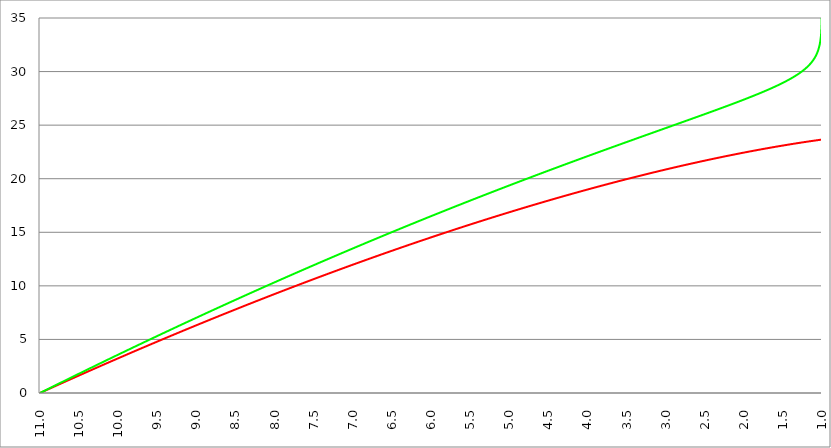
| Category | Series 1 | Series 0 | Series 2 |
|---|---|---|---|
| 11.0 | 0 | 0 |  |
| 10.995 | 0.017 | 0.018 |  |
| 10.99 | 0.033 | 0.036 |  |
| 10.985 | 0.05 | 0.055 |  |
| 10.98 | 0.066 | 0.073 |  |
| 10.975 | 0.083 | 0.091 |  |
| 10.97 | 0.099 | 0.109 |  |
| 10.96499999999999 | 0.116 | 0.128 |  |
| 10.96 | 0.133 | 0.146 |  |
| 10.955 | 0.149 | 0.164 |  |
| 10.95 | 0.166 | 0.182 |  |
| 10.945 | 0.182 | 0.2 |  |
| 10.94 | 0.199 | 0.219 |  |
| 10.93499999999999 | 0.215 | 0.237 |  |
| 10.92999999999999 | 0.232 | 0.255 |  |
| 10.92499999999999 | 0.248 | 0.273 |  |
| 10.91999999999999 | 0.265 | 0.291 |  |
| 10.91499999999999 | 0.281 | 0.31 |  |
| 10.90999999999999 | 0.298 | 0.328 |  |
| 10.90499999999999 | 0.314 | 0.346 |  |
| 10.89999999999998 | 0.331 | 0.364 |  |
| 10.89499999999998 | 0.347 | 0.382 |  |
| 10.88999999999998 | 0.364 | 0.401 |  |
| 10.88499999999998 | 0.38 | 0.419 |  |
| 10.87999999999998 | 0.397 | 0.437 |  |
| 10.87499999999998 | 0.413 | 0.455 |  |
| 10.86999999999998 | 0.43 | 0.473 |  |
| 10.86499999999998 | 0.446 | 0.491 |  |
| 10.85999999999998 | 0.463 | 0.509 |  |
| 10.85499999999998 | 0.479 | 0.528 |  |
| 10.84999999999998 | 0.496 | 0.546 |  |
| 10.84499999999998 | 0.512 | 0.564 |  |
| 10.83999999999997 | 0.529 | 0.582 |  |
| 10.83499999999997 | 0.545 | 0.6 |  |
| 10.82999999999997 | 0.562 | 0.618 |  |
| 10.82499999999997 | 0.578 | 0.636 |  |
| 10.81999999999997 | 0.595 | 0.655 |  |
| 10.81499999999997 | 0.611 | 0.673 |  |
| 10.80999999999997 | 0.627 | 0.691 |  |
| 10.80499999999997 | 0.644 | 0.709 |  |
| 10.79999999999997 | 0.66 | 0.727 |  |
| 10.79499999999997 | 0.677 | 0.745 |  |
| 10.78999999999997 | 0.693 | 0.763 |  |
| 10.78499999999997 | 0.71 | 0.781 |  |
| 10.77999999999997 | 0.726 | 0.799 |  |
| 10.77499999999996 | 0.742 | 0.817 |  |
| 10.76999999999996 | 0.759 | 0.836 |  |
| 10.76499999999996 | 0.775 | 0.854 |  |
| 10.75999999999996 | 0.792 | 0.872 |  |
| 10.75499999999996 | 0.808 | 0.89 |  |
| 10.74999999999996 | 0.824 | 0.908 |  |
| 10.74499999999996 | 0.841 | 0.926 |  |
| 10.73999999999996 | 0.857 | 0.944 |  |
| 10.73499999999996 | 0.874 | 0.962 |  |
| 10.72999999999996 | 0.89 | 0.98 |  |
| 10.72499999999996 | 0.906 | 0.998 |  |
| 10.71999999999996 | 0.923 | 1.016 |  |
| 10.71499999999996 | 0.939 | 1.034 |  |
| 10.70999999999995 | 0.955 | 1.052 |  |
| 10.70499999999995 | 0.972 | 1.07 |  |
| 10.69999999999995 | 0.988 | 1.088 |  |
| 10.69499999999995 | 1.005 | 1.107 |  |
| 10.68999999999995 | 1.021 | 1.125 |  |
| 10.68499999999995 | 1.037 | 1.143 |  |
| 10.67999999999995 | 1.054 | 1.161 |  |
| 10.67499999999995 | 1.07 | 1.179 |  |
| 10.66999999999995 | 1.086 | 1.197 |  |
| 10.66499999999995 | 1.103 | 1.215 |  |
| 10.65999999999995 | 1.119 | 1.233 |  |
| 10.65499999999995 | 1.135 | 1.251 |  |
| 10.64999999999995 | 1.152 | 1.269 |  |
| 10.64499999999994 | 1.168 | 1.287 |  |
| 10.63999999999994 | 1.184 | 1.305 |  |
| 10.63499999999994 | 1.2 | 1.323 |  |
| 10.62999999999994 | 1.217 | 1.341 |  |
| 10.62499999999994 | 1.233 | 1.359 |  |
| 10.61999999999994 | 1.249 | 1.377 |  |
| 10.61499999999994 | 1.266 | 1.395 |  |
| 10.60999999999994 | 1.282 | 1.413 |  |
| 10.60499999999994 | 1.298 | 1.431 |  |
| 10.59999999999994 | 1.315 | 1.449 |  |
| 10.59499999999994 | 1.331 | 1.467 |  |
| 10.58999999999994 | 1.347 | 1.485 |  |
| 10.58499999999994 | 1.363 | 1.503 |  |
| 10.57999999999993 | 1.38 | 1.521 |  |
| 10.57499999999993 | 1.396 | 1.538 |  |
| 10.56999999999993 | 1.412 | 1.556 |  |
| 10.56499999999993 | 1.428 | 1.574 |  |
| 10.55999999999993 | 1.445 | 1.592 |  |
| 10.55499999999993 | 1.461 | 1.61 |  |
| 10.54999999999993 | 1.477 | 1.628 |  |
| 10.54499999999993 | 1.493 | 1.646 |  |
| 10.53999999999993 | 1.51 | 1.664 |  |
| 10.53499999999993 | 1.526 | 1.682 |  |
| 10.52999999999993 | 1.542 | 1.7 |  |
| 10.52499999999993 | 1.558 | 1.718 |  |
| 10.51999999999992 | 1.574 | 1.736 |  |
| 10.51499999999992 | 1.591 | 1.754 |  |
| 10.50999999999992 | 1.607 | 1.772 |  |
| 10.50499999999992 | 1.623 | 1.79 |  |
| 10.49999999999992 | 1.639 | 1.807 |  |
| 10.49499999999992 | 1.656 | 1.825 |  |
| 10.48999999999992 | 1.672 | 1.843 |  |
| 10.48499999999992 | 1.688 | 1.861 |  |
| 10.47999999999992 | 1.704 | 1.879 |  |
| 10.47499999999992 | 1.72 | 1.897 |  |
| 10.46999999999992 | 1.736 | 1.915 |  |
| 10.46499999999992 | 1.753 | 1.933 |  |
| 10.45999999999992 | 1.769 | 1.951 |  |
| 10.45499999999991 | 1.785 | 1.969 |  |
| 10.44999999999991 | 1.801 | 1.986 |  |
| 10.44499999999991 | 1.817 | 2.004 |  |
| 10.43999999999991 | 1.833 | 2.022 |  |
| 10.43499999999991 | 1.85 | 2.04 |  |
| 10.42999999999991 | 1.866 | 2.058 |  |
| 10.42499999999991 | 1.882 | 2.076 |  |
| 10.41999999999991 | 1.898 | 2.094 |  |
| 10.41499999999991 | 1.914 | 2.111 |  |
| 10.40999999999991 | 1.93 | 2.129 |  |
| 10.40499999999991 | 1.946 | 2.147 |  |
| 10.39999999999991 | 1.963 | 2.165 |  |
| 10.39499999999991 | 1.979 | 2.183 |  |
| 10.3899999999999 | 1.995 | 2.201 |  |
| 10.3849999999999 | 2.011 | 2.218 |  |
| 10.3799999999999 | 2.027 | 2.236 |  |
| 10.3749999999999 | 2.043 | 2.254 |  |
| 10.3699999999999 | 2.059 | 2.272 |  |
| 10.3649999999999 | 2.075 | 2.29 |  |
| 10.3599999999999 | 2.091 | 2.308 |  |
| 10.3549999999999 | 2.108 | 2.325 |  |
| 10.3499999999999 | 2.124 | 2.343 |  |
| 10.3449999999999 | 2.14 | 2.361 |  |
| 10.3399999999999 | 2.156 | 2.379 |  |
| 10.3349999999999 | 2.172 | 2.397 |  |
| 10.3299999999999 | 2.188 | 2.414 |  |
| 10.32499999999989 | 2.204 | 2.432 |  |
| 10.31999999999989 | 2.22 | 2.45 |  |
| 10.31499999999989 | 2.236 | 2.468 |  |
| 10.3099999999999 | 2.252 | 2.486 |  |
| 10.3049999999999 | 2.268 | 2.503 |  |
| 10.2999999999999 | 2.284 | 2.521 |  |
| 10.29499999999989 | 2.3 | 2.539 |  |
| 10.28999999999989 | 2.316 | 2.557 |  |
| 10.28499999999989 | 2.332 | 2.574 |  |
| 10.27999999999989 | 2.348 | 2.592 |  |
| 10.27499999999989 | 2.364 | 2.61 |  |
| 10.26999999999989 | 2.381 | 2.628 |  |
| 10.26499999999989 | 2.397 | 2.645 |  |
| 10.25999999999988 | 2.413 | 2.663 |  |
| 10.25499999999988 | 2.429 | 2.681 |  |
| 10.24999999999988 | 2.445 | 2.699 |  |
| 10.24499999999988 | 2.461 | 2.716 |  |
| 10.23999999999988 | 2.477 | 2.734 |  |
| 10.23499999999988 | 2.493 | 2.752 |  |
| 10.22999999999988 | 2.509 | 2.77 |  |
| 10.22499999999988 | 2.525 | 2.787 |  |
| 10.21999999999988 | 2.541 | 2.805 |  |
| 10.21499999999988 | 2.557 | 2.823 |  |
| 10.20999999999988 | 2.573 | 2.84 |  |
| 10.20499999999988 | 2.588 | 2.858 |  |
| 10.19999999999987 | 2.604 | 2.876 |  |
| 10.19499999999987 | 2.62 | 2.894 |  |
| 10.18999999999987 | 2.636 | 2.911 |  |
| 10.18499999999987 | 2.652 | 2.929 |  |
| 10.17999999999987 | 2.668 | 2.947 |  |
| 10.17499999999987 | 2.684 | 2.964 |  |
| 10.16999999999987 | 2.7 | 2.982 |  |
| 10.16499999999987 | 2.716 | 3 |  |
| 10.15999999999987 | 2.732 | 3.017 |  |
| 10.15499999999987 | 2.748 | 3.035 |  |
| 10.14999999999987 | 2.764 | 3.053 |  |
| 10.14499999999987 | 2.78 | 3.07 |  |
| 10.13999999999987 | 2.796 | 3.088 |  |
| 10.13499999999986 | 2.812 | 3.106 |  |
| 10.12999999999986 | 2.828 | 3.123 |  |
| 10.12499999999986 | 2.844 | 3.141 |  |
| 10.11999999999986 | 2.859 | 3.159 |  |
| 10.11499999999986 | 2.875 | 3.176 |  |
| 10.10999999999986 | 2.891 | 3.194 |  |
| 10.10499999999986 | 2.907 | 3.212 |  |
| 10.09999999999986 | 2.923 | 3.229 |  |
| 10.09499999999986 | 2.939 | 3.247 |  |
| 10.08999999999986 | 2.955 | 3.265 |  |
| 10.08499999999986 | 2.971 | 3.282 |  |
| 10.07999999999986 | 2.987 | 3.3 |  |
| 10.07499999999986 | 3.002 | 3.317 |  |
| 10.06999999999985 | 3.018 | 3.335 |  |
| 10.06499999999985 | 3.034 | 3.353 |  |
| 10.05999999999985 | 3.05 | 3.37 |  |
| 10.05499999999985 | 3.066 | 3.388 |  |
| 10.04999999999985 | 3.082 | 3.405 |  |
| 10.04499999999985 | 3.098 | 3.423 |  |
| 10.03999999999985 | 3.113 | 3.441 |  |
| 10.03499999999985 | 3.129 | 3.458 |  |
| 10.02999999999985 | 3.145 | 3.476 |  |
| 10.02499999999985 | 3.161 | 3.493 |  |
| 10.01999999999985 | 3.177 | 3.511 |  |
| 10.01499999999985 | 3.193 | 3.529 |  |
| 10.00999999999985 | 3.208 | 3.546 |  |
| 10.00499999999984 | 3.224 | 3.564 |  |
| 9.999999999999844 | 3.24 | 3.581 |  |
| 9.994999999999841 | 3.256 | 3.599 |  |
| 9.98999999999984 | 3.272 | 3.616 |  |
| 9.98499999999984 | 3.287 | 3.634 |  |
| 9.97999999999984 | 3.303 | 3.652 |  |
| 9.97499999999984 | 3.319 | 3.669 |  |
| 9.969999999999837 | 3.335 | 3.687 |  |
| 9.964999999999838 | 3.351 | 3.704 |  |
| 9.959999999999837 | 3.366 | 3.722 |  |
| 9.954999999999837 | 3.382 | 3.739 |  |
| 9.949999999999836 | 3.398 | 3.757 |  |
| 9.944999999999835 | 3.414 | 3.774 |  |
| 9.939999999999834 | 3.43 | 3.792 |  |
| 9.934999999999834 | 3.445 | 3.809 |  |
| 9.929999999999833 | 3.461 | 3.827 |  |
| 9.92499999999983 | 3.477 | 3.844 |  |
| 9.91999999999983 | 3.493 | 3.862 |  |
| 9.91499999999983 | 3.508 | 3.879 |  |
| 9.90999999999983 | 3.524 | 3.897 |  |
| 9.904999999999829 | 3.54 | 3.914 |  |
| 9.899999999999826 | 3.555 | 3.932 |  |
| 9.894999999999827 | 3.571 | 3.949 |  |
| 9.889999999999826 | 3.587 | 3.967 |  |
| 9.884999999999826 | 3.603 | 3.984 |  |
| 9.879999999999823 | 3.618 | 4.002 |  |
| 9.874999999999824 | 3.634 | 4.019 |  |
| 9.869999999999823 | 3.65 | 4.037 |  |
| 9.864999999999823 | 3.666 | 4.054 |  |
| 9.85999999999982 | 3.681 | 4.072 |  |
| 9.85499999999982 | 3.697 | 4.089 |  |
| 9.84999999999982 | 3.713 | 4.107 |  |
| 9.84499999999982 | 3.728 | 4.124 |  |
| 9.839999999999819 | 3.744 | 4.142 |  |
| 9.834999999999818 | 3.76 | 4.159 |  |
| 9.829999999999817 | 3.775 | 4.177 |  |
| 9.824999999999816 | 3.791 | 4.194 |  |
| 9.819999999999816 | 3.807 | 4.212 |  |
| 9.814999999999815 | 3.822 | 4.229 |  |
| 9.809999999999812 | 3.838 | 4.246 |  |
| 9.804999999999813 | 3.854 | 4.264 |  |
| 9.799999999999812 | 3.869 | 4.281 |  |
| 9.794999999999812 | 3.885 | 4.299 |  |
| 9.78999999999981 | 3.901 | 4.316 |  |
| 9.78499999999981 | 3.916 | 4.334 |  |
| 9.77999999999981 | 3.932 | 4.351 |  |
| 9.774999999999809 | 3.948 | 4.368 |  |
| 9.769999999999808 | 3.963 | 4.386 |  |
| 9.764999999999807 | 3.979 | 4.403 |  |
| 9.759999999999806 | 3.994 | 4.421 |  |
| 9.754999999999805 | 4.01 | 4.438 |  |
| 9.749999999999805 | 4.026 | 4.455 |  |
| 9.744999999999804 | 4.041 | 4.473 |  |
| 9.739999999999803 | 4.057 | 4.49 |  |
| 9.734999999999802 | 4.072 | 4.508 |  |
| 9.729999999999801 | 4.088 | 4.525 |  |
| 9.7249999999998 | 4.104 | 4.542 |  |
| 9.7199999999998 | 4.119 | 4.56 |  |
| 9.7149999999998 | 4.135 | 4.577 |  |
| 9.709999999999798 | 4.15 | 4.594 |  |
| 9.704999999999798 | 4.166 | 4.612 |  |
| 9.699999999999797 | 4.182 | 4.629 |  |
| 9.694999999999794 | 4.197 | 4.647 |  |
| 9.689999999999795 | 4.213 | 4.664 |  |
| 9.684999999999794 | 4.228 | 4.681 |  |
| 9.679999999999794 | 4.244 | 4.699 |  |
| 9.674999999999793 | 4.259 | 4.716 |  |
| 9.66999999999979 | 4.275 | 4.733 |  |
| 9.66499999999979 | 4.291 | 4.751 |  |
| 9.65999999999979 | 4.306 | 4.768 |  |
| 9.65499999999979 | 4.322 | 4.785 |  |
| 9.649999999999787 | 4.337 | 4.803 |  |
| 9.644999999999788 | 4.353 | 4.82 |  |
| 9.639999999999787 | 4.368 | 4.837 |  |
| 9.634999999999787 | 4.384 | 4.855 |  |
| 9.629999999999786 | 4.399 | 4.872 |  |
| 9.624999999999785 | 4.415 | 4.889 |  |
| 9.619999999999784 | 4.43 | 4.907 |  |
| 9.614999999999783 | 4.446 | 4.924 |  |
| 9.609999999999783 | 4.461 | 4.941 |  |
| 9.60499999999978 | 4.477 | 4.958 |  |
| 9.59999999999978 | 4.492 | 4.976 |  |
| 9.59499999999978 | 4.508 | 4.993 |  |
| 9.58999999999978 | 4.523 | 5.01 |  |
| 9.584999999999779 | 4.539 | 5.028 |  |
| 9.579999999999778 | 4.554 | 5.045 |  |
| 9.574999999999777 | 4.57 | 5.062 |  |
| 9.569999999999776 | 4.585 | 5.079 |  |
| 9.564999999999776 | 4.601 | 5.097 |  |
| 9.559999999999773 | 4.616 | 5.114 |  |
| 9.554999999999774 | 4.632 | 5.131 |  |
| 9.549999999999773 | 4.647 | 5.149 |  |
| 9.544999999999773 | 4.662 | 5.166 |  |
| 9.539999999999772 | 4.678 | 5.183 |  |
| 9.534999999999771 | 4.693 | 5.2 |  |
| 9.52999999999977 | 4.709 | 5.218 |  |
| 9.52499999999977 | 4.724 | 5.235 |  |
| 9.519999999999769 | 4.74 | 5.252 |  |
| 9.514999999999768 | 4.755 | 5.269 |  |
| 9.509999999999767 | 4.77 | 5.286 |  |
| 9.504999999999766 | 4.786 | 5.304 |  |
| 9.499999999999766 | 4.801 | 5.321 |  |
| 9.494999999999765 | 4.817 | 5.338 |  |
| 9.489999999999762 | 4.832 | 5.355 |  |
| 9.484999999999763 | 4.847 | 5.373 |  |
| 9.47999999999976 | 4.863 | 5.39 |  |
| 9.47499999999976 | 4.878 | 5.407 |  |
| 9.46999999999976 | 4.894 | 5.424 |  |
| 9.46499999999976 | 4.909 | 5.441 |  |
| 9.45999999999976 | 4.924 | 5.459 |  |
| 9.454999999999758 | 4.94 | 5.476 |  |
| 9.449999999999758 | 4.955 | 5.493 |  |
| 9.444999999999757 | 4.971 | 5.51 |  |
| 9.439999999999756 | 4.986 | 5.527 |  |
| 9.434999999999755 | 5.001 | 5.545 |  |
| 9.429999999999755 | 5.017 | 5.562 |  |
| 9.424999999999754 | 5.032 | 5.579 |  |
| 9.419999999999751 | 5.047 | 5.596 |  |
| 9.414999999999752 | 5.063 | 5.613 |  |
| 9.40999999999975 | 5.078 | 5.63 |  |
| 9.40499999999975 | 5.093 | 5.648 |  |
| 9.39999999999975 | 5.109 | 5.665 |  |
| 9.39499999999975 | 5.124 | 5.682 |  |
| 9.389999999999748 | 5.139 | 5.699 |  |
| 9.384999999999748 | 5.155 | 5.716 |  |
| 9.379999999999747 | 5.17 | 5.733 |  |
| 9.374999999999744 | 5.185 | 5.75 |  |
| 9.369999999999745 | 5.201 | 5.768 |  |
| 9.364999999999744 | 5.216 | 5.785 |  |
| 9.35999999999974 | 5.231 | 5.802 |  |
| 9.35499999999974 | 5.246 | 5.819 |  |
| 9.34999999999974 | 5.262 | 5.836 |  |
| 9.34499999999974 | 5.277 | 5.853 |  |
| 9.33999999999974 | 5.292 | 5.87 |  |
| 9.33499999999974 | 5.308 | 5.887 |  |
| 9.329999999999737 | 5.323 | 5.905 |  |
| 9.324999999999738 | 5.338 | 5.922 |  |
| 9.319999999999737 | 5.353 | 5.939 |  |
| 9.314999999999737 | 5.369 | 5.956 |  |
| 9.309999999999736 | 5.384 | 5.973 |  |
| 9.304999999999733 | 5.399 | 5.99 |  |
| 9.299999999999734 | 5.414 | 6.007 |  |
| 9.294999999999733 | 5.43 | 6.024 |  |
| 9.289999999999733 | 5.445 | 6.041 |  |
| 9.28499999999973 | 5.46 | 6.058 |  |
| 9.27999999999973 | 5.475 | 6.075 |  |
| 9.27499999999973 | 5.491 | 6.093 |  |
| 9.26999999999973 | 5.506 | 6.11 |  |
| 9.264999999999729 | 5.521 | 6.127 |  |
| 9.259999999999726 | 5.536 | 6.144 |  |
| 9.254999999999727 | 5.552 | 6.161 |  |
| 9.249999999999726 | 5.567 | 6.178 |  |
| 9.244999999999726 | 5.582 | 6.195 |  |
| 9.239999999999725 | 5.597 | 6.212 |  |
| 9.234999999999724 | 5.612 | 6.229 |  |
| 9.229999999999723 | 5.628 | 6.246 |  |
| 9.224999999999723 | 5.643 | 6.263 |  |
| 9.219999999999722 | 5.658 | 6.28 |  |
| 9.214999999999721 | 5.673 | 6.297 |  |
| 9.20999999999972 | 5.688 | 6.314 |  |
| 9.20499999999972 | 5.703 | 6.331 |  |
| 9.199999999999719 | 5.719 | 6.348 |  |
| 9.194999999999718 | 5.734 | 6.365 |  |
| 9.189999999999717 | 5.749 | 6.382 |  |
| 9.184999999999716 | 5.764 | 6.399 |  |
| 9.179999999999715 | 5.779 | 6.416 |  |
| 9.174999999999715 | 5.794 | 6.433 |  |
| 9.169999999999712 | 5.81 | 6.45 |  |
| 9.164999999999713 | 5.825 | 6.467 |  |
| 9.15999999999971 | 5.84 | 6.484 |  |
| 9.15499999999971 | 5.855 | 6.501 |  |
| 9.14999999999971 | 5.87 | 6.518 |  |
| 9.14499999999971 | 5.885 | 6.535 |  |
| 9.13999999999971 | 5.9 | 6.552 |  |
| 9.134999999999708 | 5.915 | 6.569 |  |
| 9.129999999999708 | 5.931 | 6.586 |  |
| 9.124999999999707 | 5.946 | 6.603 |  |
| 9.119999999999706 | 5.961 | 6.62 |  |
| 9.114999999999705 | 5.976 | 6.637 |  |
| 9.109999999999705 | 5.991 | 6.654 |  |
| 9.104999999999704 | 6.006 | 6.671 |  |
| 9.099999999999701 | 6.021 | 6.688 |  |
| 9.094999999999702 | 6.036 | 6.705 |  |
| 9.0899999999997 | 6.051 | 6.722 |  |
| 9.0849999999997 | 6.066 | 6.739 |  |
| 9.0799999999997 | 6.081 | 6.755 |  |
| 9.0749999999997 | 6.096 | 6.772 |  |
| 9.069999999999698 | 6.112 | 6.789 |  |
| 9.064999999999698 | 6.127 | 6.806 |  |
| 9.059999999999697 | 6.142 | 6.823 |  |
| 9.054999999999694 | 6.157 | 6.84 |  |
| 9.049999999999695 | 6.172 | 6.857 |  |
| 9.044999999999694 | 6.187 | 6.874 |  |
| 9.039999999999694 | 6.202 | 6.891 |  |
| 9.034999999999693 | 6.217 | 6.908 |  |
| 9.02999999999969 | 6.232 | 6.925 |  |
| 9.02499999999969 | 6.247 | 6.942 |  |
| 9.01999999999969 | 6.262 | 6.958 |  |
| 9.01499999999969 | 6.277 | 6.975 |  |
| 9.009999999999687 | 6.292 | 6.992 |  |
| 9.004999999999688 | 6.307 | 7.009 |  |
| 8.999999999999687 | 6.322 | 7.026 |  |
| 8.994999999999687 | 6.337 | 7.043 |  |
| 8.989999999999686 | 6.352 | 7.06 |  |
| 8.984999999999683 | 6.367 | 7.077 |  |
| 8.979999999999684 | 6.382 | 7.093 |  |
| 8.974999999999683 | 6.397 | 7.11 |  |
| 8.96999999999968 | 6.412 | 7.127 |  |
| 8.96499999999968 | 6.427 | 7.144 |  |
| 8.95999999999968 | 6.442 | 7.161 |  |
| 8.95499999999968 | 6.457 | 7.178 |  |
| 8.94999999999968 | 6.472 | 7.195 |  |
| 8.944999999999679 | 6.487 | 7.211 |  |
| 8.939999999999676 | 6.502 | 7.228 |  |
| 8.934999999999677 | 6.517 | 7.245 |  |
| 8.929999999999676 | 6.532 | 7.262 |  |
| 8.924999999999676 | 6.546 | 7.279 |  |
| 8.919999999999675 | 6.561 | 7.295 |  |
| 8.914999999999674 | 6.576 | 7.312 |  |
| 8.909999999999673 | 6.591 | 7.329 |  |
| 8.904999999999673 | 6.606 | 7.346 |  |
| 8.89999999999967 | 6.621 | 7.363 |  |
| 8.89499999999967 | 6.636 | 7.38 |  |
| 8.88999999999967 | 6.651 | 7.396 |  |
| 8.88499999999967 | 6.666 | 7.413 |  |
| 8.879999999999669 | 6.681 | 7.43 |  |
| 8.874999999999668 | 6.696 | 7.447 |  |
| 8.869999999999665 | 6.711 | 7.464 |  |
| 8.864999999999666 | 6.725 | 7.48 |  |
| 8.859999999999665 | 6.74 | 7.497 |  |
| 8.854999999999665 | 6.755 | 7.514 |  |
| 8.849999999999662 | 6.77 | 7.531 |  |
| 8.844999999999663 | 6.785 | 7.547 |  |
| 8.83999999999966 | 6.8 | 7.564 |  |
| 8.83499999999966 | 6.815 | 7.581 |  |
| 8.82999999999966 | 6.829 | 7.598 |  |
| 8.82499999999966 | 6.844 | 7.614 |  |
| 8.81999999999966 | 6.859 | 7.631 |  |
| 8.814999999999658 | 6.874 | 7.648 |  |
| 8.809999999999658 | 6.889 | 7.665 |  |
| 8.804999999999657 | 6.904 | 7.681 |  |
| 8.799999999999656 | 6.919 | 7.698 |  |
| 8.794999999999655 | 6.933 | 7.715 |  |
| 8.789999999999655 | 6.948 | 7.732 |  |
| 8.784999999999654 | 6.963 | 7.748 |  |
| 8.779999999999651 | 6.978 | 7.765 |  |
| 8.774999999999652 | 6.993 | 7.782 |  |
| 8.76999999999965 | 7.007 | 7.798 |  |
| 8.76499999999965 | 7.022 | 7.815 |  |
| 8.75999999999965 | 7.037 | 7.832 |  |
| 8.754999999999647 | 7.052 | 7.849 |  |
| 8.749999999999648 | 7.067 | 7.865 |  |
| 8.744999999999647 | 7.081 | 7.882 |  |
| 8.739999999999647 | 7.096 | 7.899 |  |
| 8.734999999999644 | 7.111 | 7.915 |  |
| 8.729999999999645 | 7.126 | 7.932 |  |
| 8.724999999999644 | 7.141 | 7.949 |  |
| 8.719999999999644 | 7.155 | 7.965 |  |
| 8.714999999999643 | 7.17 | 7.982 |  |
| 8.70999999999964 | 7.185 | 7.999 |  |
| 8.70499999999964 | 7.2 | 8.015 |  |
| 8.69999999999964 | 7.214 | 8.032 |  |
| 8.69499999999964 | 7.229 | 8.049 |  |
| 8.689999999999637 | 7.244 | 8.065 |  |
| 8.684999999999638 | 7.259 | 8.082 |  |
| 8.679999999999637 | 7.273 | 8.099 |  |
| 8.674999999999637 | 7.288 | 8.115 |  |
| 8.669999999999636 | 7.303 | 8.132 |  |
| 8.664999999999633 | 7.318 | 8.149 |  |
| 8.659999999999634 | 7.332 | 8.165 |  |
| 8.654999999999633 | 7.347 | 8.182 |  |
| 8.649999999999633 | 7.362 | 8.199 |  |
| 8.644999999999632 | 7.376 | 8.215 |  |
| 8.63999999999963 | 7.391 | 8.232 |  |
| 8.63499999999963 | 7.406 | 8.248 |  |
| 8.62999999999963 | 7.42 | 8.265 |  |
| 8.624999999999629 | 7.435 | 8.282 |  |
| 8.619999999999626 | 7.45 | 8.298 |  |
| 8.614999999999627 | 7.464 | 8.315 |  |
| 8.609999999999626 | 7.479 | 8.331 |  |
| 8.604999999999626 | 7.494 | 8.348 |  |
| 8.599999999999625 | 7.508 | 8.365 |  |
| 8.594999999999624 | 7.523 | 8.381 |  |
| 8.589999999999623 | 7.538 | 8.398 |  |
| 8.584999999999622 | 7.552 | 8.414 |  |
| 8.57999999999962 | 7.567 | 8.431 |  |
| 8.57499999999962 | 7.582 | 8.448 |  |
| 8.56999999999962 | 7.596 | 8.464 |  |
| 8.56499999999962 | 7.611 | 8.481 |  |
| 8.559999999999619 | 7.626 | 8.497 |  |
| 8.554999999999618 | 7.64 | 8.514 |  |
| 8.549999999999617 | 7.655 | 8.53 |  |
| 8.544999999999616 | 7.67 | 8.547 |  |
| 8.539999999999615 | 7.684 | 8.564 |  |
| 8.534999999999615 | 7.699 | 8.58 |  |
| 8.529999999999612 | 7.713 | 8.597 |  |
| 8.524999999999613 | 7.728 | 8.613 |  |
| 8.51999999999961 | 7.743 | 8.63 |  |
| 8.51499999999961 | 7.757 | 8.646 |  |
| 8.50999999999961 | 7.772 | 8.663 |  |
| 8.50499999999961 | 7.786 | 8.679 |  |
| 8.49999999999961 | 7.801 | 8.696 |  |
| 8.494999999999608 | 7.815 | 8.712 |  |
| 8.489999999999608 | 7.83 | 8.729 |  |
| 8.484999999999607 | 7.845 | 8.745 |  |
| 8.479999999999606 | 7.859 | 8.762 |  |
| 8.474999999999605 | 7.874 | 8.778 |  |
| 8.469999999999605 | 7.888 | 8.795 |  |
| 8.464999999999604 | 7.903 | 8.811 |  |
| 8.4599999999996 | 7.917 | 8.828 |  |
| 8.4549999999996 | 7.932 | 8.844 |  |
| 8.4499999999996 | 7.946 | 8.861 |  |
| 8.4449999999996 | 7.961 | 8.877 |  |
| 8.4399999999996 | 7.976 | 8.894 |  |
| 8.4349999999996 | 7.99 | 8.91 |  |
| 8.429999999999598 | 8.005 | 8.927 |  |
| 8.424999999999597 | 8.019 | 8.943 |  |
| 8.419999999999597 | 8.034 | 8.96 |  |
| 8.414999999999594 | 8.048 | 8.976 |  |
| 8.409999999999595 | 8.063 | 8.993 |  |
| 8.404999999999594 | 8.077 | 9.009 |  |
| 8.399999999999594 | 8.092 | 9.025 |  |
| 8.394999999999593 | 8.106 | 9.042 |  |
| 8.38999999999959 | 8.121 | 9.058 |  |
| 8.38499999999959 | 8.135 | 9.075 |  |
| 8.37999999999959 | 8.15 | 9.091 |  |
| 8.37499999999959 | 8.164 | 9.108 |  |
| 8.369999999999589 | 8.178 | 9.124 |  |
| 8.364999999999588 | 8.193 | 9.141 |  |
| 8.359999999999587 | 8.207 | 9.157 |  |
| 8.354999999999587 | 8.222 | 9.173 |  |
| 8.349999999999586 | 8.236 | 9.19 |  |
| 8.344999999999585 | 8.251 | 9.206 |  |
| 8.339999999999584 | 8.265 | 9.223 |  |
| 8.334999999999583 | 8.28 | 9.239 |  |
| 8.329999999999583 | 8.294 | 9.255 |  |
| 8.324999999999582 | 8.308 | 9.272 |  |
| 8.31999999999958 | 8.323 | 9.288 |  |
| 8.31499999999958 | 8.337 | 9.305 |  |
| 8.30999999999958 | 8.352 | 9.321 |  |
| 8.304999999999579 | 8.366 | 9.337 |  |
| 8.299999999999578 | 8.381 | 9.354 |  |
| 8.294999999999577 | 8.395 | 9.37 |  |
| 8.289999999999576 | 8.409 | 9.387 |  |
| 8.284999999999576 | 8.424 | 9.403 |  |
| 8.279999999999575 | 8.438 | 9.419 |  |
| 8.274999999999574 | 8.453 | 9.436 |  |
| 8.269999999999573 | 8.467 | 9.452 |  |
| 8.264999999999572 | 8.481 | 9.468 |  |
| 8.259999999999572 | 8.496 | 9.485 |  |
| 8.254999999999571 | 8.51 | 9.501 |  |
| 8.24999999999957 | 8.524 | 9.517 |  |
| 8.24499999999957 | 8.539 | 9.534 |  |
| 8.239999999999569 | 8.553 | 9.55 |  |
| 8.234999999999568 | 8.567 | 9.566 |  |
| 8.229999999999567 | 8.582 | 9.583 |  |
| 8.224999999999566 | 8.596 | 9.599 |  |
| 8.219999999999565 | 8.61 | 9.615 |  |
| 8.214999999999565 | 8.625 | 9.632 |  |
| 8.209999999999564 | 8.639 | 9.648 |  |
| 8.204999999999563 | 8.653 | 9.664 |  |
| 8.199999999999562 | 8.668 | 9.681 |  |
| 8.194999999999562 | 8.682 | 9.697 |  |
| 8.18999999999956 | 8.696 | 9.713 |  |
| 8.18499999999956 | 8.711 | 9.73 |  |
| 8.17999999999956 | 8.725 | 9.746 |  |
| 8.174999999999558 | 8.739 | 9.762 |  |
| 8.169999999999558 | 8.754 | 9.778 |  |
| 8.164999999999557 | 8.768 | 9.795 |  |
| 8.159999999999556 | 8.782 | 9.811 |  |
| 8.154999999999555 | 8.796 | 9.827 |  |
| 8.149999999999554 | 8.811 | 9.844 |  |
| 8.144999999999554 | 8.825 | 9.86 |  |
| 8.139999999999553 | 8.839 | 9.876 |  |
| 8.134999999999552 | 8.854 | 9.892 |  |
| 8.129999999999551 | 8.868 | 9.909 |  |
| 8.12499999999955 | 8.882 | 9.925 |  |
| 8.11999999999955 | 8.896 | 9.941 |  |
| 8.11499999999955 | 8.911 | 9.957 |  |
| 8.109999999999548 | 8.925 | 9.974 |  |
| 8.104999999999547 | 8.939 | 9.99 |  |
| 8.099999999999547 | 8.953 | 10.006 |  |
| 8.094999999999544 | 8.967 | 10.022 |  |
| 8.089999999999545 | 8.982 | 10.038 |  |
| 8.084999999999544 | 8.996 | 10.055 |  |
| 8.079999999999544 | 9.01 | 10.071 |  |
| 8.074999999999543 | 9.024 | 10.087 |  |
| 8.06999999999954 | 9.039 | 10.103 |  |
| 8.06499999999954 | 9.053 | 10.12 |  |
| 8.05999999999954 | 9.067 | 10.136 |  |
| 8.05499999999954 | 9.081 | 10.152 |  |
| 8.049999999999539 | 9.095 | 10.168 |  |
| 8.044999999999538 | 9.11 | 10.184 |  |
| 8.039999999999537 | 9.124 | 10.201 |  |
| 8.034999999999537 | 9.138 | 10.217 |  |
| 8.029999999999536 | 9.152 | 10.233 |  |
| 8.024999999999535 | 9.166 | 10.249 |  |
| 8.019999999999534 | 9.18 | 10.265 |  |
| 8.014999999999533 | 9.195 | 10.281 |  |
| 8.009999999999533 | 9.209 | 10.298 |  |
| 8.004999999999532 | 9.223 | 10.314 |  |
| 7.999999999999531 | 9.237 | 10.33 |  |
| 7.994999999999532 | 9.251 | 10.346 |  |
| 7.989999999999532 | 9.265 | 10.362 |  |
| 7.984999999999532 | 9.279 | 10.378 |  |
| 7.979999999999532 | 9.294 | 10.395 |  |
| 7.974999999999532 | 9.308 | 10.411 |  |
| 7.969999999999532 | 9.322 | 10.427 |  |
| 7.964999999999533 | 9.336 | 10.443 |  |
| 7.959999999999532 | 9.35 | 10.459 |  |
| 7.954999999999533 | 9.364 | 10.475 |  |
| 7.949999999999532 | 9.378 | 10.491 |  |
| 7.944999999999533 | 9.392 | 10.508 |  |
| 7.939999999999533 | 9.406 | 10.524 |  |
| 7.934999999999533 | 9.42 | 10.54 |  |
| 7.929999999999533 | 9.435 | 10.556 |  |
| 7.924999999999534 | 9.449 | 10.572 |  |
| 7.919999999999533 | 9.463 | 10.588 |  |
| 7.914999999999534 | 9.477 | 10.604 |  |
| 7.909999999999533 | 9.491 | 10.62 |  |
| 7.904999999999534 | 9.505 | 10.636 |  |
| 7.899999999999534 | 9.519 | 10.653 |  |
| 7.894999999999534 | 9.533 | 10.669 |  |
| 7.889999999999534 | 9.547 | 10.685 |  |
| 7.884999999999534 | 9.561 | 10.701 |  |
| 7.879999999999534 | 9.575 | 10.717 |  |
| 7.874999999999534 | 9.589 | 10.733 |  |
| 7.869999999999534 | 9.603 | 10.749 |  |
| 7.864999999999535 | 9.617 | 10.765 |  |
| 7.859999999999534 | 9.631 | 10.781 |  |
| 7.854999999999535 | 9.645 | 10.797 |  |
| 7.849999999999535 | 9.659 | 10.813 |  |
| 7.844999999999535 | 9.673 | 10.829 |  |
| 7.839999999999535 | 9.687 | 10.845 |  |
| 7.834999999999535 | 9.701 | 10.861 |  |
| 7.829999999999535 | 9.715 | 10.877 |  |
| 7.824999999999536 | 9.729 | 10.893 |  |
| 7.819999999999535 | 9.743 | 10.91 |  |
| 7.814999999999536 | 9.757 | 10.926 |  |
| 7.809999999999535 | 9.771 | 10.942 |  |
| 7.804999999999536 | 9.785 | 10.958 |  |
| 7.799999999999536 | 9.799 | 10.974 |  |
| 7.794999999999536 | 9.813 | 10.99 |  |
| 7.789999999999536 | 9.827 | 11.006 |  |
| 7.784999999999536 | 9.841 | 11.022 |  |
| 7.779999999999536 | 9.855 | 11.038 |  |
| 7.774999999999536 | 9.869 | 11.054 |  |
| 7.769999999999536 | 9.883 | 11.07 |  |
| 7.764999999999537 | 9.897 | 11.086 |  |
| 7.759999999999536 | 9.911 | 11.102 |  |
| 7.754999999999537 | 9.925 | 11.118 |  |
| 7.749999999999537 | 9.939 | 11.134 |  |
| 7.744999999999537 | 9.952 | 11.15 |  |
| 7.739999999999537 | 9.966 | 11.166 |  |
| 7.734999999999537 | 9.98 | 11.182 |  |
| 7.729999999999537 | 9.994 | 11.198 |  |
| 7.724999999999538 | 10.008 | 11.213 |  |
| 7.719999999999537 | 10.022 | 11.229 |  |
| 7.714999999999538 | 10.036 | 11.245 |  |
| 7.709999999999538 | 10.05 | 11.261 |  |
| 7.704999999999538 | 10.064 | 11.277 |  |
| 7.699999999999538 | 10.077 | 11.293 |  |
| 7.694999999999538 | 10.091 | 11.309 |  |
| 7.689999999999538 | 10.105 | 11.325 |  |
| 7.684999999999539 | 10.119 | 11.341 |  |
| 7.679999999999538 | 10.133 | 11.357 |  |
| 7.674999999999539 | 10.147 | 11.373 |  |
| 7.669999999999539 | 10.161 | 11.389 |  |
| 7.664999999999539 | 10.175 | 11.405 |  |
| 7.65999999999954 | 10.188 | 11.421 |  |
| 7.654999999999539 | 10.202 | 11.437 |  |
| 7.64999999999954 | 10.216 | 11.453 |  |
| 7.644999999999539 | 10.23 | 11.468 |  |
| 7.63999999999954 | 10.244 | 11.484 |  |
| 7.63499999999954 | 10.257 | 11.5 |  |
| 7.62999999999954 | 10.271 | 11.516 |  |
| 7.62499999999954 | 10.285 | 11.532 |  |
| 7.61999999999954 | 10.299 | 11.548 |  |
| 7.61499999999954 | 10.313 | 11.564 |  |
| 7.60999999999954 | 10.327 | 11.58 |  |
| 7.60499999999954 | 10.34 | 11.596 |  |
| 7.59999999999954 | 10.354 | 11.611 |  |
| 7.594999999999541 | 10.368 | 11.627 |  |
| 7.58999999999954 | 10.382 | 11.643 |  |
| 7.584999999999541 | 10.395 | 11.659 |  |
| 7.57999999999954 | 10.409 | 11.675 |  |
| 7.574999999999541 | 10.423 | 11.691 |  |
| 7.569999999999541 | 10.437 | 11.707 |  |
| 7.564999999999541 | 10.45 | 11.722 |  |
| 7.559999999999541 | 10.464 | 11.738 |  |
| 7.554999999999541 | 10.478 | 11.754 |  |
| 7.549999999999541 | 10.492 | 11.77 |  |
| 7.544999999999542 | 10.505 | 11.786 |  |
| 7.539999999999541 | 10.519 | 11.802 |  |
| 7.534999999999542 | 10.533 | 11.817 |  |
| 7.529999999999542 | 10.547 | 11.833 |  |
| 7.524999999999542 | 10.56 | 11.849 |  |
| 7.519999999999542 | 10.574 | 11.865 |  |
| 7.514999999999542 | 10.588 | 11.881 |  |
| 7.509999999999542 | 10.601 | 11.897 |  |
| 7.504999999999542 | 10.615 | 11.912 |  |
| 7.499999999999542 | 10.629 | 11.928 |  |
| 7.494999999999543 | 10.643 | 11.944 |  |
| 7.489999999999542 | 10.656 | 11.96 |  |
| 7.484999999999543 | 10.67 | 11.976 |  |
| 7.479999999999542 | 10.684 | 11.991 |  |
| 7.474999999999543 | 10.697 | 12.007 |  |
| 7.469999999999543 | 10.711 | 12.023 |  |
| 7.464999999999543 | 10.725 | 12.039 |  |
| 7.459999999999543 | 10.738 | 12.054 |  |
| 7.454999999999544 | 10.752 | 12.07 |  |
| 7.449999999999543 | 10.766 | 12.086 |  |
| 7.444999999999544 | 10.779 | 12.102 |  |
| 7.439999999999543 | 10.793 | 12.117 |  |
| 7.434999999999544 | 10.806 | 12.133 |  |
| 7.429999999999544 | 10.82 | 12.149 |  |
| 7.424999999999544 | 10.834 | 12.165 |  |
| 7.419999999999544 | 10.847 | 12.18 |  |
| 7.414999999999544 | 10.861 | 12.196 |  |
| 7.409999999999544 | 10.875 | 12.212 |  |
| 7.404999999999544 | 10.888 | 12.228 |  |
| 7.399999999999544 | 10.902 | 12.243 |  |
| 7.394999999999545 | 10.915 | 12.259 |  |
| 7.389999999999544 | 10.929 | 12.275 |  |
| 7.384999999999545 | 10.943 | 12.291 |  |
| 7.379999999999545 | 10.956 | 12.306 |  |
| 7.374999999999545 | 10.97 | 12.322 |  |
| 7.369999999999545 | 10.983 | 12.338 |  |
| 7.364999999999545 | 10.997 | 12.353 |  |
| 7.359999999999545 | 11.01 | 12.369 |  |
| 7.354999999999546 | 11.024 | 12.385 |  |
| 7.349999999999545 | 11.038 | 12.4 |  |
| 7.344999999999546 | 11.051 | 12.416 |  |
| 7.339999999999545 | 11.065 | 12.432 |  |
| 7.334999999999546 | 11.078 | 12.448 |  |
| 7.329999999999546 | 11.092 | 12.463 |  |
| 7.324999999999546 | 11.105 | 12.479 |  |
| 7.319999999999546 | 11.119 | 12.495 |  |
| 7.314999999999546 | 11.132 | 12.51 |  |
| 7.309999999999546 | 11.146 | 12.526 |  |
| 7.304999999999547 | 11.159 | 12.542 |  |
| 7.299999999999546 | 11.173 | 12.557 |  |
| 7.294999999999547 | 11.186 | 12.573 |  |
| 7.289999999999547 | 11.2 | 12.589 |  |
| 7.284999999999547 | 11.213 | 12.604 |  |
| 7.279999999999547 | 11.227 | 12.62 |  |
| 7.274999999999547 | 11.24 | 12.635 |  |
| 7.269999999999547 | 11.254 | 12.651 |  |
| 7.264999999999548 | 11.267 | 12.667 |  |
| 7.259999999999547 | 11.281 | 12.682 |  |
| 7.254999999999548 | 11.294 | 12.698 |  |
| 7.249999999999547 | 11.308 | 12.714 |  |
| 7.244999999999548 | 11.321 | 12.729 |  |
| 7.239999999999548 | 11.335 | 12.745 |  |
| 7.234999999999548 | 11.348 | 12.76 |  |
| 7.229999999999548 | 11.362 | 12.776 |  |
| 7.224999999999548 | 11.375 | 12.792 |  |
| 7.219999999999548 | 11.388 | 12.807 |  |
| 7.214999999999549 | 11.402 | 12.823 |  |
| 7.209999999999548 | 11.415 | 12.838 |  |
| 7.204999999999549 | 11.429 | 12.854 |  |
| 7.199999999999549 | 11.442 | 12.87 |  |
| 7.194999999999549 | 11.456 | 12.885 |  |
| 7.18999999999955 | 11.469 | 12.901 |  |
| 7.184999999999549 | 11.482 | 12.916 |  |
| 7.17999999999955 | 11.496 | 12.932 |  |
| 7.17499999999955 | 11.509 | 12.947 |  |
| 7.16999999999955 | 11.523 | 12.963 |  |
| 7.16499999999955 | 11.536 | 12.979 |  |
| 7.15999999999955 | 11.549 | 12.994 |  |
| 7.15499999999955 | 11.563 | 13.01 |  |
| 7.14999999999955 | 11.576 | 13.025 |  |
| 7.14499999999955 | 11.589 | 13.041 |  |
| 7.13999999999955 | 11.603 | 13.056 |  |
| 7.13499999999955 | 11.616 | 13.072 |  |
| 7.12999999999955 | 11.63 | 13.087 |  |
| 7.124999999999551 | 11.643 | 13.103 |  |
| 7.119999999999551 | 11.656 | 13.118 |  |
| 7.114999999999551 | 11.67 | 13.134 |  |
| 7.109999999999551 | 11.683 | 13.149 |  |
| 7.104999999999551 | 11.696 | 13.165 |  |
| 7.099999999999551 | 11.71 | 13.18 |  |
| 7.094999999999551 | 11.723 | 13.196 |  |
| 7.089999999999551 | 11.736 | 13.211 |  |
| 7.084999999999551 | 11.75 | 13.227 |  |
| 7.079999999999551 | 11.763 | 13.242 |  |
| 7.074999999999552 | 11.776 | 13.258 |  |
| 7.069999999999552 | 11.789 | 13.273 |  |
| 7.064999999999552 | 11.803 | 13.289 |  |
| 7.059999999999552 | 11.816 | 13.304 |  |
| 7.054999999999552 | 11.829 | 13.32 |  |
| 7.049999999999552 | 11.843 | 13.335 |  |
| 7.044999999999552 | 11.856 | 13.351 |  |
| 7.039999999999552 | 11.869 | 13.366 |  |
| 7.034999999999552 | 11.882 | 13.382 |  |
| 7.029999999999553 | 11.896 | 13.397 |  |
| 7.024999999999553 | 11.909 | 13.413 |  |
| 7.019999999999553 | 11.922 | 13.428 |  |
| 7.014999999999553 | 11.935 | 13.444 |  |
| 7.009999999999553 | 11.949 | 13.459 |  |
| 7.004999999999553 | 11.962 | 13.474 |  |
| 6.999999999999553 | 11.975 | 13.49 |  |
| 6.994999999999553 | 11.988 | 13.505 |  |
| 6.989999999999553 | 12.002 | 13.521 |  |
| 6.984999999999554 | 12.015 | 13.536 |  |
| 6.979999999999553 | 12.028 | 13.552 |  |
| 6.974999999999554 | 12.041 | 13.567 |  |
| 6.969999999999554 | 12.054 | 13.582 |  |
| 6.964999999999554 | 12.068 | 13.598 |  |
| 6.959999999999554 | 12.081 | 13.613 |  |
| 6.954999999999554 | 12.094 | 13.629 |  |
| 6.949999999999554 | 12.107 | 13.644 |  |
| 6.944999999999554 | 12.12 | 13.659 |  |
| 6.939999999999554 | 12.133 | 13.675 |  |
| 6.934999999999554 | 12.147 | 13.69 |  |
| 6.929999999999554 | 12.16 | 13.706 |  |
| 6.924999999999555 | 12.173 | 13.721 |  |
| 6.919999999999554 | 12.186 | 13.736 |  |
| 6.914999999999555 | 12.199 | 13.752 |  |
| 6.909999999999555 | 12.212 | 13.767 |  |
| 6.904999999999555 | 12.226 | 13.782 |  |
| 6.899999999999555 | 12.239 | 13.798 |  |
| 6.894999999999555 | 12.252 | 13.813 |  |
| 6.889999999999555 | 12.265 | 13.828 |  |
| 6.884999999999556 | 12.278 | 13.844 |  |
| 6.879999999999555 | 12.291 | 13.859 |  |
| 6.874999999999556 | 12.304 | 13.875 |  |
| 6.869999999999556 | 12.317 | 13.89 |  |
| 6.864999999999556 | 12.331 | 13.905 |  |
| 6.859999999999556 | 12.344 | 13.921 |  |
| 6.854999999999556 | 12.357 | 13.936 |  |
| 6.849999999999556 | 12.37 | 13.951 |  |
| 6.844999999999556 | 12.383 | 13.966 |  |
| 6.839999999999556 | 12.396 | 13.982 |  |
| 6.834999999999557 | 12.409 | 13.997 |  |
| 6.829999999999557 | 12.422 | 14.012 |  |
| 6.824999999999557 | 12.435 | 14.028 |  |
| 6.819999999999557 | 12.448 | 14.043 |  |
| 6.814999999999557 | 12.461 | 14.058 |  |
| 6.809999999999557 | 12.474 | 14.074 |  |
| 6.804999999999557 | 12.487 | 14.089 |  |
| 6.799999999999557 | 12.5 | 14.104 |  |
| 6.794999999999558 | 12.513 | 14.12 |  |
| 6.789999999999557 | 12.526 | 14.135 |  |
| 6.784999999999558 | 12.54 | 14.15 |  |
| 6.779999999999557 | 12.553 | 14.165 |  |
| 6.774999999999558 | 12.566 | 14.181 |  |
| 6.769999999999558 | 12.579 | 14.196 |  |
| 6.764999999999558 | 12.592 | 14.211 |  |
| 6.759999999999558 | 12.605 | 14.226 |  |
| 6.754999999999558 | 12.618 | 14.242 |  |
| 6.749999999999558 | 12.631 | 14.257 |  |
| 6.744999999999559 | 12.644 | 14.272 |  |
| 6.739999999999558 | 12.657 | 14.287 |  |
| 6.734999999999559 | 12.67 | 14.303 |  |
| 6.729999999999559 | 12.682 | 14.318 |  |
| 6.724999999999559 | 12.695 | 14.333 |  |
| 6.71999999999956 | 12.708 | 14.348 |  |
| 6.714999999999559 | 12.721 | 14.364 |  |
| 6.70999999999956 | 12.734 | 14.379 |  |
| 6.704999999999559 | 12.747 | 14.394 |  |
| 6.69999999999956 | 12.76 | 14.409 |  |
| 6.69499999999956 | 12.773 | 14.424 |  |
| 6.68999999999956 | 12.786 | 14.44 |  |
| 6.68499999999956 | 12.799 | 14.455 |  |
| 6.67999999999956 | 12.812 | 14.47 |  |
| 6.67499999999956 | 12.825 | 14.485 |  |
| 6.66999999999956 | 12.838 | 14.5 |  |
| 6.66499999999956 | 12.851 | 14.516 |  |
| 6.65999999999956 | 12.864 | 14.531 |  |
| 6.654999999999561 | 12.877 | 14.546 |  |
| 6.64999999999956 | 12.889 | 14.561 |  |
| 6.644999999999561 | 12.902 | 14.576 |  |
| 6.63999999999956 | 12.915 | 14.592 |  |
| 6.634999999999561 | 12.928 | 14.607 |  |
| 6.629999999999561 | 12.941 | 14.622 |  |
| 6.624999999999561 | 12.954 | 14.637 |  |
| 6.619999999999561 | 12.967 | 14.652 |  |
| 6.614999999999561 | 12.98 | 14.667 |  |
| 6.609999999999561 | 12.992 | 14.682 |  |
| 6.604999999999562 | 13.005 | 14.698 |  |
| 6.599999999999561 | 13.018 | 14.713 |  |
| 6.594999999999562 | 13.031 | 14.728 |  |
| 6.589999999999561 | 13.044 | 14.743 |  |
| 6.584999999999562 | 13.057 | 14.758 |  |
| 6.579999999999562 | 13.069 | 14.773 |  |
| 6.574999999999562 | 13.082 | 14.788 |  |
| 6.569999999999562 | 13.095 | 14.804 |  |
| 6.564999999999563 | 13.108 | 14.819 |  |
| 6.559999999999562 | 13.121 | 14.834 |  |
| 6.554999999999563 | 13.134 | 14.849 |  |
| 6.549999999999562 | 13.146 | 14.864 |  |
| 6.544999999999563 | 13.159 | 14.879 |  |
| 6.539999999999563 | 13.172 | 14.894 |  |
| 6.534999999999563 | 13.185 | 14.909 |  |
| 6.529999999999563 | 13.197 | 14.924 |  |
| 6.524999999999563 | 13.21 | 14.939 |  |
| 6.519999999999563 | 13.223 | 14.954 |  |
| 6.514999999999564 | 13.236 | 14.97 |  |
| 6.509999999999563 | 13.249 | 14.985 |  |
| 6.504999999999564 | 13.261 | 15 |  |
| 6.499999999999563 | 13.274 | 15.015 |  |
| 6.494999999999564 | 13.287 | 15.03 |  |
| 6.489999999999564 | 13.3 | 15.045 |  |
| 6.484999999999564 | 13.312 | 15.06 |  |
| 6.479999999999564 | 13.325 | 15.075 |  |
| 6.474999999999564 | 13.338 | 15.09 |  |
| 6.469999999999564 | 13.35 | 15.105 |  |
| 6.464999999999564 | 13.363 | 15.12 |  |
| 6.459999999999564 | 13.376 | 15.135 |  |
| 6.454999999999564 | 13.389 | 15.15 |  |
| 6.449999999999564 | 13.401 | 15.165 |  |
| 6.444999999999565 | 13.414 | 15.18 |  |
| 6.439999999999565 | 13.427 | 15.195 |  |
| 6.434999999999565 | 13.439 | 15.21 |  |
| 6.429999999999565 | 13.452 | 15.225 |  |
| 6.424999999999565 | 13.465 | 15.24 |  |
| 6.419999999999565 | 13.477 | 15.255 |  |
| 6.414999999999565 | 13.49 | 15.27 |  |
| 6.409999999999565 | 13.503 | 15.285 |  |
| 6.404999999999565 | 13.515 | 15.3 |  |
| 6.399999999999565 | 13.528 | 15.315 |  |
| 6.394999999999566 | 13.541 | 15.33 |  |
| 6.389999999999566 | 13.553 | 15.345 |  |
| 6.384999999999566 | 13.566 | 15.36 |  |
| 6.379999999999566 | 13.579 | 15.375 |  |
| 6.374999999999566 | 13.591 | 15.39 |  |
| 6.369999999999566 | 13.604 | 15.405 |  |
| 6.364999999999567 | 13.616 | 15.42 |  |
| 6.359999999999566 | 13.629 | 15.435 |  |
| 6.354999999999567 | 13.642 | 15.45 |  |
| 6.349999999999567 | 13.654 | 15.465 |  |
| 6.344999999999567 | 13.667 | 15.48 |  |
| 6.339999999999567 | 13.679 | 15.495 |  |
| 6.334999999999567 | 13.692 | 15.51 |  |
| 6.329999999999567 | 13.705 | 15.525 |  |
| 6.324999999999568 | 13.717 | 15.54 |  |
| 6.319999999999567 | 13.73 | 15.555 |  |
| 6.314999999999568 | 13.742 | 15.57 |  |
| 6.309999999999567 | 13.755 | 15.585 |  |
| 6.304999999999568 | 13.767 | 15.6 |  |
| 6.299999999999568 | 13.78 | 15.614 |  |
| 6.294999999999568 | 13.793 | 15.629 |  |
| 6.289999999999568 | 13.805 | 15.644 |  |
| 6.284999999999568 | 13.818 | 15.659 |  |
| 6.279999999999568 | 13.83 | 15.674 |  |
| 6.274999999999568 | 13.843 | 15.689 |  |
| 6.269999999999568 | 13.855 | 15.704 |  |
| 6.264999999999569 | 13.868 | 15.719 |  |
| 6.259999999999568 | 13.88 | 15.734 |  |
| 6.25499999999957 | 13.893 | 15.749 |  |
| 6.24999999999957 | 13.905 | 15.763 |  |
| 6.24499999999957 | 13.918 | 15.778 |  |
| 6.23999999999957 | 13.93 | 15.793 |  |
| 6.23499999999957 | 13.943 | 15.808 |  |
| 6.22999999999957 | 13.955 | 15.823 |  |
| 6.22499999999957 | 13.968 | 15.838 |  |
| 6.21999999999957 | 13.98 | 15.853 |  |
| 6.21499999999957 | 13.993 | 15.868 |  |
| 6.20999999999957 | 14.005 | 15.882 |  |
| 6.20499999999957 | 14.018 | 15.897 |  |
| 6.19999999999957 | 14.03 | 15.912 |  |
| 6.19499999999957 | 14.042 | 15.927 |  |
| 6.18999999999957 | 14.055 | 15.942 |  |
| 6.184999999999571 | 14.067 | 15.957 |  |
| 6.17999999999957 | 14.08 | 15.971 |  |
| 6.174999999999571 | 14.092 | 15.986 |  |
| 6.169999999999571 | 14.105 | 16.001 |  |
| 6.164999999999571 | 14.117 | 16.016 |  |
| 6.159999999999571 | 14.129 | 16.031 |  |
| 6.154999999999571 | 14.142 | 16.046 |  |
| 6.149999999999571 | 14.154 | 16.06 |  |
| 6.144999999999571 | 14.167 | 16.075 |  |
| 6.139999999999571 | 14.179 | 16.09 |  |
| 6.134999999999572 | 14.191 | 16.105 |  |
| 6.129999999999572 | 14.204 | 16.12 |  |
| 6.124999999999572 | 14.216 | 16.134 |  |
| 6.119999999999572 | 14.229 | 16.149 |  |
| 6.114999999999572 | 14.241 | 16.164 |  |
| 6.109999999999572 | 14.253 | 16.179 |  |
| 6.104999999999572 | 14.266 | 16.193 |  |
| 6.099999999999572 | 14.278 | 16.208 |  |
| 6.094999999999573 | 14.29 | 16.223 |  |
| 6.089999999999572 | 14.303 | 16.238 |  |
| 6.084999999999573 | 14.315 | 16.252 |  |
| 6.079999999999572 | 14.327 | 16.267 |  |
| 6.074999999999573 | 14.34 | 16.282 |  |
| 6.069999999999573 | 14.352 | 16.297 |  |
| 6.064999999999573 | 14.364 | 16.312 |  |
| 6.059999999999573 | 14.377 | 16.326 |  |
| 6.054999999999573 | 14.389 | 16.341 |  |
| 6.049999999999573 | 14.401 | 16.356 |  |
| 6.044999999999574 | 14.414 | 16.37 |  |
| 6.039999999999573 | 14.426 | 16.385 |  |
| 6.034999999999574 | 14.438 | 16.4 |  |
| 6.029999999999574 | 14.45 | 16.415 |  |
| 6.024999999999574 | 14.463 | 16.429 |  |
| 6.019999999999574 | 14.475 | 16.444 |  |
| 6.014999999999574 | 14.487 | 16.459 |  |
| 6.009999999999574 | 14.499 | 16.473 |  |
| 6.004999999999574 | 14.512 | 16.488 |  |
| 5.999999999999574 | 14.524 | 16.503 |  |
| 5.994999999999574 | 14.536 | 16.518 |  |
| 5.989999999999574 | 14.548 | 16.532 |  |
| 5.984999999999574 | 14.561 | 16.547 |  |
| 5.979999999999574 | 14.573 | 16.562 |  |
| 5.974999999999575 | 14.585 | 16.576 |  |
| 5.969999999999575 | 14.597 | 16.591 |  |
| 5.964999999999575 | 14.61 | 16.606 |  |
| 5.959999999999575 | 14.622 | 16.62 |  |
| 5.954999999999575 | 14.634 | 16.635 |  |
| 5.949999999999575 | 14.646 | 16.65 |  |
| 5.944999999999575 | 14.658 | 16.664 |  |
| 5.939999999999575 | 14.671 | 16.679 |  |
| 5.934999999999575 | 14.683 | 16.694 |  |
| 5.929999999999576 | 14.695 | 16.708 |  |
| 5.924999999999576 | 14.707 | 16.723 |  |
| 5.919999999999576 | 14.719 | 16.738 |  |
| 5.914999999999576 | 14.731 | 16.752 |  |
| 5.909999999999576 | 14.744 | 16.767 |  |
| 5.904999999999576 | 14.756 | 16.781 |  |
| 5.899999999999576 | 14.768 | 16.796 |  |
| 5.894999999999577 | 14.78 | 16.811 |  |
| 5.889999999999576 | 14.792 | 16.825 |  |
| 5.884999999999577 | 14.804 | 16.84 |  |
| 5.879999999999577 | 14.816 | 16.855 |  |
| 5.874999999999577 | 14.829 | 16.869 |  |
| 5.869999999999577 | 14.841 | 16.884 |  |
| 5.864999999999577 | 14.853 | 16.898 |  |
| 5.859999999999577 | 14.865 | 16.913 |  |
| 5.854999999999578 | 14.877 | 16.928 |  |
| 5.849999999999577 | 14.889 | 16.942 |  |
| 5.844999999999578 | 14.901 | 16.957 |  |
| 5.839999999999577 | 14.913 | 16.971 |  |
| 5.834999999999578 | 14.925 | 16.986 |  |
| 5.829999999999578 | 14.937 | 17 |  |
| 5.824999999999578 | 14.949 | 17.015 |  |
| 5.819999999999578 | 14.962 | 17.03 |  |
| 5.814999999999578 | 14.974 | 17.044 |  |
| 5.809999999999578 | 14.986 | 17.059 |  |
| 5.804999999999579 | 14.998 | 17.073 |  |
| 5.799999999999578 | 15.01 | 17.088 |  |
| 5.794999999999579 | 15.022 | 17.102 |  |
| 5.789999999999578 | 15.034 | 17.117 |  |
| 5.78499999999958 | 15.046 | 17.131 |  |
| 5.77999999999958 | 15.058 | 17.146 |  |
| 5.77499999999958 | 15.07 | 17.161 |  |
| 5.76999999999958 | 15.082 | 17.175 |  |
| 5.764999999999579 | 15.094 | 17.19 |  |
| 5.75999999999958 | 15.106 | 17.204 |  |
| 5.75499999999958 | 15.118 | 17.219 |  |
| 5.74999999999958 | 15.13 | 17.233 |  |
| 5.74499999999958 | 15.142 | 17.248 |  |
| 5.73999999999958 | 15.154 | 17.262 |  |
| 5.73499999999958 | 15.166 | 17.277 |  |
| 5.72999999999958 | 15.178 | 17.291 |  |
| 5.72499999999958 | 15.19 | 17.306 |  |
| 5.71999999999958 | 15.202 | 17.32 |  |
| 5.714999999999581 | 15.214 | 17.335 |  |
| 5.70999999999958 | 15.226 | 17.349 |  |
| 5.704999999999581 | 15.238 | 17.364 |  |
| 5.699999999999581 | 15.25 | 17.378 |  |
| 5.694999999999581 | 15.261 | 17.393 |  |
| 5.689999999999581 | 15.273 | 17.407 |  |
| 5.684999999999581 | 15.285 | 17.422 |  |
| 5.679999999999581 | 15.297 | 17.436 |  |
| 5.674999999999581 | 15.309 | 17.45 |  |
| 5.669999999999581 | 15.321 | 17.465 |  |
| 5.664999999999582 | 15.333 | 17.479 |  |
| 5.659999999999582 | 15.345 | 17.494 |  |
| 5.654999999999582 | 15.357 | 17.508 |  |
| 5.649999999999582 | 15.369 | 17.523 |  |
| 5.644999999999582 | 15.381 | 17.537 |  |
| 5.639999999999582 | 15.392 | 17.552 |  |
| 5.634999999999582 | 15.404 | 17.566 |  |
| 5.629999999999582 | 15.416 | 17.58 |  |
| 5.624999999999582 | 15.428 | 17.595 |  |
| 5.619999999999583 | 15.44 | 17.609 |  |
| 5.614999999999583 | 15.452 | 17.624 |  |
| 5.609999999999583 | 15.464 | 17.638 |  |
| 5.604999999999583 | 15.475 | 17.653 |  |
| 5.599999999999583 | 15.487 | 17.667 |  |
| 5.594999999999583 | 15.499 | 17.681 |  |
| 5.589999999999583 | 15.511 | 17.696 |  |
| 5.584999999999583 | 15.523 | 17.71 |  |
| 5.579999999999583 | 15.535 | 17.724 |  |
| 5.574999999999584 | 15.546 | 17.739 |  |
| 5.569999999999584 | 15.558 | 17.753 |  |
| 5.564999999999584 | 15.57 | 17.768 |  |
| 5.559999999999584 | 15.582 | 17.782 |  |
| 5.554999999999584 | 15.594 | 17.796 |  |
| 5.549999999999584 | 15.605 | 17.811 |  |
| 5.544999999999584 | 15.617 | 17.825 |  |
| 5.539999999999584 | 15.629 | 17.84 |  |
| 5.534999999999584 | 15.641 | 17.854 |  |
| 5.529999999999584 | 15.652 | 17.868 |  |
| 5.524999999999585 | 15.664 | 17.883 |  |
| 5.519999999999584 | 15.676 | 17.897 |  |
| 5.514999999999585 | 15.688 | 17.911 |  |
| 5.509999999999585 | 15.699 | 17.926 |  |
| 5.504999999999585 | 15.711 | 17.94 |  |
| 5.499999999999585 | 15.723 | 17.954 |  |
| 5.494999999999585 | 15.735 | 17.969 |  |
| 5.489999999999585 | 15.746 | 17.983 |  |
| 5.484999999999585 | 15.758 | 17.997 |  |
| 5.479999999999585 | 15.77 | 18.012 |  |
| 5.474999999999585 | 15.781 | 18.026 |  |
| 5.469999999999585 | 15.793 | 18.04 |  |
| 5.464999999999586 | 15.805 | 18.055 |  |
| 5.459999999999586 | 15.816 | 18.069 |  |
| 5.454999999999586 | 15.828 | 18.083 |  |
| 5.449999999999586 | 15.84 | 18.097 |  |
| 5.444999999999586 | 15.851 | 18.112 |  |
| 5.439999999999586 | 15.863 | 18.126 |  |
| 5.434999999999586 | 15.875 | 18.14 |  |
| 5.429999999999586 | 15.886 | 18.155 |  |
| 5.424999999999587 | 15.898 | 18.169 |  |
| 5.419999999999586 | 15.91 | 18.183 |  |
| 5.414999999999587 | 15.921 | 18.197 |  |
| 5.409999999999587 | 15.933 | 18.212 |  |
| 5.404999999999587 | 15.945 | 18.226 |  |
| 5.399999999999587 | 15.956 | 18.24 |  |
| 5.394999999999587 | 15.968 | 18.254 |  |
| 5.389999999999587 | 15.979 | 18.269 |  |
| 5.384999999999588 | 15.991 | 18.283 |  |
| 5.379999999999587 | 16.003 | 18.297 |  |
| 5.374999999999588 | 16.014 | 18.311 |  |
| 5.369999999999588 | 16.026 | 18.326 |  |
| 5.364999999999588 | 16.037 | 18.34 |  |
| 5.359999999999588 | 16.049 | 18.354 |  |
| 5.354999999999588 | 16.061 | 18.368 |  |
| 5.349999999999588 | 16.072 | 18.383 |  |
| 5.344999999999588 | 16.084 | 18.397 |  |
| 5.339999999999588 | 16.095 | 18.411 |  |
| 5.334999999999589 | 16.107 | 18.425 |  |
| 5.329999999999589 | 16.118 | 18.439 |  |
| 5.324999999999589 | 16.13 | 18.454 |  |
| 5.31999999999959 | 16.141 | 18.468 |  |
| 5.314999999999589 | 16.153 | 18.482 |  |
| 5.30999999999959 | 16.165 | 18.496 |  |
| 5.304999999999589 | 16.176 | 18.51 |  |
| 5.29999999999959 | 16.188 | 18.525 |  |
| 5.29499999999959 | 16.199 | 18.539 |  |
| 5.28999999999959 | 16.211 | 18.553 |  |
| 5.28499999999959 | 16.222 | 18.567 |  |
| 5.27999999999959 | 16.234 | 18.581 |  |
| 5.27499999999959 | 16.245 | 18.596 |  |
| 5.26999999999959 | 16.257 | 18.61 |  |
| 5.26499999999959 | 16.268 | 18.624 |  |
| 5.25999999999959 | 16.279 | 18.638 |  |
| 5.25499999999959 | 16.291 | 18.652 |  |
| 5.24999999999959 | 16.302 | 18.666 |  |
| 5.244999999999591 | 16.314 | 18.681 |  |
| 5.23999999999959 | 16.325 | 18.695 |  |
| 5.234999999999591 | 16.337 | 18.709 |  |
| 5.229999999999591 | 16.348 | 18.723 |  |
| 5.224999999999591 | 16.36 | 18.737 |  |
| 5.219999999999591 | 16.371 | 18.751 |  |
| 5.214999999999591 | 16.382 | 18.765 |  |
| 5.209999999999591 | 16.394 | 18.779 |  |
| 5.204999999999591 | 16.405 | 18.794 |  |
| 5.199999999999592 | 16.417 | 18.808 |  |
| 5.194999999999592 | 16.428 | 18.822 |  |
| 5.189999999999592 | 16.439 | 18.836 |  |
| 5.184999999999592 | 16.451 | 18.85 |  |
| 5.179999999999592 | 16.462 | 18.864 |  |
| 5.174999999999592 | 16.474 | 18.878 |  |
| 5.169999999999592 | 16.485 | 18.892 |  |
| 5.164999999999592 | 16.496 | 18.906 |  |
| 5.159999999999592 | 16.508 | 18.921 |  |
| 5.154999999999593 | 16.519 | 18.935 |  |
| 5.149999999999593 | 16.53 | 18.949 |  |
| 5.144999999999593 | 16.542 | 18.963 |  |
| 5.139999999999593 | 16.553 | 18.977 |  |
| 5.134999999999593 | 16.564 | 18.991 |  |
| 5.129999999999593 | 16.576 | 19.005 |  |
| 5.124999999999593 | 16.587 | 19.019 |  |
| 5.119999999999593 | 16.598 | 19.033 |  |
| 5.114999999999593 | 16.61 | 19.047 |  |
| 5.109999999999594 | 16.621 | 19.061 |  |
| 5.104999999999594 | 16.632 | 19.075 |  |
| 5.099999999999594 | 16.644 | 19.089 |  |
| 5.094999999999594 | 16.655 | 19.103 |  |
| 5.089999999999594 | 16.666 | 19.117 |  |
| 5.084999999999594 | 16.677 | 19.131 |  |
| 5.079999999999594 | 16.689 | 19.145 |  |
| 5.074999999999594 | 16.7 | 19.16 |  |
| 5.069999999999594 | 16.711 | 19.174 |  |
| 5.064999999999594 | 16.723 | 19.188 |  |
| 5.059999999999594 | 16.734 | 19.202 |  |
| 5.054999999999595 | 16.745 | 19.216 |  |
| 5.049999999999594 | 16.756 | 19.23 |  |
| 5.044999999999595 | 16.768 | 19.244 |  |
| 5.039999999999595 | 16.779 | 19.258 |  |
| 5.034999999999595 | 16.79 | 19.272 |  |
| 5.029999999999595 | 16.801 | 19.286 |  |
| 5.024999999999595 | 16.812 | 19.3 |  |
| 5.019999999999595 | 16.824 | 19.314 |  |
| 5.014999999999596 | 16.835 | 19.328 |  |
| 5.009999999999595 | 16.846 | 19.342 |  |
| 5.004999999999596 | 16.857 | 19.356 |  |
| 4.999999999999595 | 16.868 | 19.37 |  |
| 4.994999999999596 | 16.88 | 19.384 |  |
| 4.989999999999596 | 16.891 | 19.397 |  |
| 4.984999999999596 | 16.902 | 19.411 |  |
| 4.979999999999596 | 16.913 | 19.425 |  |
| 4.974999999999596 | 16.924 | 19.439 |  |
| 4.969999999999596 | 16.935 | 19.453 |  |
| 4.964999999999597 | 16.946 | 19.467 |  |
| 4.959999999999596 | 16.958 | 19.481 |  |
| 4.954999999999597 | 16.969 | 19.495 |  |
| 4.949999999999596 | 16.98 | 19.509 |  |
| 4.944999999999597 | 16.991 | 19.523 |  |
| 4.939999999999597 | 17.002 | 19.537 |  |
| 4.934999999999597 | 17.013 | 19.551 |  |
| 4.929999999999597 | 17.024 | 19.565 |  |
| 4.924999999999597 | 17.035 | 19.579 |  |
| 4.919999999999597 | 17.047 | 19.593 |  |
| 4.914999999999598 | 17.058 | 19.607 |  |
| 4.909999999999597 | 17.069 | 19.621 |  |
| 4.904999999999598 | 17.08 | 19.634 |  |
| 4.899999999999598 | 17.091 | 19.648 |  |
| 4.894999999999598 | 17.102 | 19.662 |  |
| 4.889999999999598 | 17.113 | 19.676 |  |
| 4.884999999999598 | 17.124 | 19.69 |  |
| 4.879999999999598 | 17.135 | 19.704 |  |
| 4.874999999999598 | 17.146 | 19.718 |  |
| 4.869999999999599 | 17.157 | 19.732 |  |
| 4.864999999999599 | 17.168 | 19.746 |  |
| 4.859999999999599 | 17.179 | 19.759 |  |
| 4.854999999999599 | 17.19 | 19.773 |  |
| 4.8499999999996 | 17.201 | 19.787 |  |
| 4.844999999999599 | 17.212 | 19.801 |  |
| 4.8399999999996 | 17.223 | 19.815 |  |
| 4.834999999999599 | 17.234 | 19.829 |  |
| 4.829999999999599 | 17.245 | 19.843 |  |
| 4.8249999999996 | 17.256 | 19.857 |  |
| 4.8199999999996 | 17.267 | 19.87 |  |
| 4.8149999999996 | 17.278 | 19.884 |  |
| 4.8099999999996 | 17.289 | 19.898 |  |
| 4.8049999999996 | 17.3 | 19.912 |  |
| 4.7999999999996 | 17.311 | 19.926 |  |
| 4.7949999999996 | 17.322 | 19.94 |  |
| 4.7899999999996 | 17.333 | 19.953 |  |
| 4.7849999999996 | 17.344 | 19.967 |  |
| 4.7799999999996 | 17.355 | 19.981 |  |
| 4.7749999999996 | 17.366 | 19.995 |  |
| 4.7699999999996 | 17.377 | 20.009 |  |
| 4.764999999999601 | 17.388 | 20.023 |  |
| 4.7599999999996 | 17.399 | 20.036 |  |
| 4.754999999999601 | 17.409 | 20.05 |  |
| 4.7499999999996 | 17.42 | 20.064 |  |
| 4.744999999999601 | 17.431 | 20.078 |  |
| 4.7399999999996 | 17.442 | 20.092 |  |
| 4.734999999999601 | 17.453 | 20.105 |  |
| 4.729999999999601 | 17.464 | 20.119 |  |
| 4.724999999999602 | 17.475 | 20.133 |  |
| 4.719999999999601 | 17.486 | 20.147 |  |
| 4.714999999999602 | 17.496 | 20.161 |  |
| 4.709999999999601 | 17.507 | 20.174 |  |
| 4.704999999999602 | 17.518 | 20.188 |  |
| 4.699999999999602 | 17.529 | 20.202 |  |
| 4.694999999999602 | 17.54 | 20.216 |  |
| 4.689999999999602 | 17.551 | 20.229 |  |
| 4.684999999999602 | 17.562 | 20.243 |  |
| 4.679999999999602 | 17.572 | 20.257 |  |
| 4.674999999999603 | 17.583 | 20.271 |  |
| 4.669999999999603 | 17.594 | 20.284 |  |
| 4.664999999999603 | 17.605 | 20.298 |  |
| 4.659999999999603 | 17.616 | 20.312 |  |
| 4.654999999999603 | 17.626 | 20.326 |  |
| 4.649999999999603 | 17.637 | 20.339 |  |
| 4.644999999999603 | 17.648 | 20.353 |  |
| 4.639999999999603 | 17.659 | 20.367 |  |
| 4.634999999999604 | 17.669 | 20.381 |  |
| 4.629999999999604 | 17.68 | 20.394 |  |
| 4.624999999999604 | 17.691 | 20.408 |  |
| 4.619999999999604 | 17.702 | 20.422 |  |
| 4.614999999999604 | 17.712 | 20.435 |  |
| 4.609999999999604 | 17.723 | 20.449 |  |
| 4.604999999999604 | 17.734 | 20.463 |  |
| 4.599999999999604 | 17.745 | 20.477 |  |
| 4.594999999999604 | 17.755 | 20.49 |  |
| 4.589999999999604 | 17.766 | 20.504 |  |
| 4.584999999999604 | 17.777 | 20.518 |  |
| 4.579999999999604 | 17.787 | 20.531 |  |
| 4.574999999999604 | 17.798 | 20.545 |  |
| 4.569999999999605 | 17.809 | 20.559 |  |
| 4.564999999999605 | 17.82 | 20.572 |  |
| 4.559999999999605 | 17.83 | 20.586 |  |
| 4.554999999999605 | 17.841 | 20.6 |  |
| 4.549999999999605 | 17.852 | 20.613 |  |
| 4.544999999999605 | 17.862 | 20.627 |  |
| 4.539999999999605 | 17.873 | 20.641 |  |
| 4.534999999999605 | 17.884 | 20.654 |  |
| 4.529999999999605 | 17.894 | 20.668 |  |
| 4.524999999999606 | 17.905 | 20.682 |  |
| 4.519999999999606 | 17.915 | 20.695 |  |
| 4.514999999999606 | 17.926 | 20.709 |  |
| 4.509999999999606 | 17.937 | 20.723 |  |
| 4.504999999999606 | 17.947 | 20.736 |  |
| 4.499999999999606 | 17.958 | 20.75 |  |
| 4.494999999999606 | 17.969 | 20.764 |  |
| 4.489999999999606 | 17.979 | 20.777 |  |
| 4.484999999999606 | 17.99 | 20.791 |  |
| 4.479999999999606 | 18 | 20.804 |  |
| 4.474999999999607 | 18.011 | 20.818 |  |
| 4.469999999999607 | 18.021 | 20.832 |  |
| 4.464999999999607 | 18.032 | 20.845 |  |
| 4.459999999999607 | 18.043 | 20.859 |  |
| 4.454999999999607 | 18.053 | 20.873 |  |
| 4.449999999999607 | 18.064 | 20.886 |  |
| 4.444999999999607 | 18.074 | 20.9 |  |
| 4.439999999999607 | 18.085 | 20.913 |  |
| 4.434999999999607 | 18.095 | 20.927 |  |
| 4.429999999999607 | 18.106 | 20.941 |  |
| 4.424999999999608 | 18.116 | 20.954 |  |
| 4.419999999999608 | 18.127 | 20.968 |  |
| 4.414999999999608 | 18.137 | 20.981 |  |
| 4.409999999999608 | 18.148 | 20.995 |  |
| 4.404999999999608 | 18.158 | 21.008 |  |
| 4.399999999999608 | 18.169 | 21.022 |  |
| 4.394999999999609 | 18.179 | 21.036 |  |
| 4.389999999999608 | 18.19 | 21.049 |  |
| 4.384999999999609 | 18.2 | 21.063 |  |
| 4.37999999999961 | 18.211 | 21.076 |  |
| 4.37499999999961 | 18.221 | 21.09 |  |
| 4.36999999999961 | 18.232 | 21.103 |  |
| 4.364999999999609 | 18.242 | 21.117 |  |
| 4.35999999999961 | 18.253 | 21.131 |  |
| 4.35499999999961 | 18.263 | 21.144 |  |
| 4.34999999999961 | 18.273 | 21.158 |  |
| 4.34499999999961 | 18.284 | 21.171 |  |
| 4.33999999999961 | 18.294 | 21.185 |  |
| 4.33499999999961 | 18.305 | 21.198 |  |
| 4.32999999999961 | 18.315 | 21.212 |  |
| 4.32499999999961 | 18.326 | 21.225 |  |
| 4.31999999999961 | 18.336 | 21.239 |  |
| 4.31499999999961 | 18.346 | 21.252 |  |
| 4.30999999999961 | 18.357 | 21.266 |  |
| 4.304999999999611 | 18.367 | 21.279 |  |
| 4.29999999999961 | 18.377 | 21.293 |  |
| 4.294999999999611 | 18.388 | 21.306 |  |
| 4.28999999999961 | 18.398 | 21.32 |  |
| 4.284999999999611 | 18.409 | 21.333 |  |
| 4.27999999999961 | 18.419 | 21.347 |  |
| 4.274999999999611 | 18.429 | 21.36 |  |
| 4.269999999999611 | 18.44 | 21.374 |  |
| 4.264999999999612 | 18.45 | 21.387 |  |
| 4.259999999999611 | 18.46 | 21.401 |  |
| 4.254999999999612 | 18.471 | 21.414 |  |
| 4.249999999999611 | 18.481 | 21.428 |  |
| 4.244999999999612 | 18.491 | 21.441 |  |
| 4.239999999999612 | 18.501 | 21.455 |  |
| 4.234999999999612 | 18.512 | 21.468 |  |
| 4.229999999999612 | 18.522 | 21.482 |  |
| 4.224999999999612 | 18.532 | 21.495 |  |
| 4.219999999999612 | 18.543 | 21.509 |  |
| 4.214999999999613 | 18.553 | 21.522 |  |
| 4.209999999999612 | 18.563 | 21.536 |  |
| 4.204999999999613 | 18.573 | 21.549 |  |
| 4.199999999999613 | 18.584 | 21.562 |  |
| 4.194999999999613 | 18.594 | 21.576 |  |
| 4.189999999999613 | 18.604 | 21.589 |  |
| 4.184999999999613 | 18.614 | 21.603 |  |
| 4.179999999999613 | 18.625 | 21.616 |  |
| 4.174999999999613 | 18.635 | 21.63 |  |
| 4.169999999999614 | 18.645 | 21.643 |  |
| 4.164999999999614 | 18.655 | 21.657 |  |
| 4.159999999999614 | 18.665 | 21.67 |  |
| 4.154999999999614 | 18.676 | 21.683 |  |
| 4.149999999999614 | 18.686 | 21.697 |  |
| 4.144999999999614 | 18.696 | 21.71 |  |
| 4.139999999999614 | 18.706 | 21.724 |  |
| 4.134999999999614 | 18.716 | 21.737 |  |
| 4.129999999999614 | 18.726 | 21.75 |  |
| 4.124999999999615 | 18.737 | 21.764 |  |
| 4.119999999999614 | 18.747 | 21.777 |  |
| 4.114999999999615 | 18.757 | 21.791 |  |
| 4.109999999999614 | 18.767 | 21.804 |  |
| 4.104999999999615 | 18.777 | 21.817 |  |
| 4.099999999999615 | 18.787 | 21.831 |  |
| 4.094999999999615 | 18.797 | 21.844 |  |
| 4.089999999999615 | 18.808 | 21.858 |  |
| 4.084999999999615 | 18.818 | 21.871 |  |
| 4.079999999999615 | 18.828 | 21.884 |  |
| 4.074999999999615 | 18.838 | 21.898 |  |
| 4.069999999999615 | 18.848 | 21.911 |  |
| 4.064999999999616 | 18.858 | 21.925 |  |
| 4.059999999999615 | 18.868 | 21.938 |  |
| 4.054999999999616 | 18.878 | 21.951 |  |
| 4.049999999999616 | 18.888 | 21.965 |  |
| 4.044999999999616 | 18.898 | 21.978 |  |
| 4.039999999999616 | 18.908 | 21.991 |  |
| 4.034999999999616 | 18.918 | 22.005 |  |
| 4.029999999999616 | 18.928 | 22.018 |  |
| 4.024999999999617 | 18.939 | 22.031 |  |
| 4.019999999999616 | 18.949 | 22.045 |  |
| 4.014999999999617 | 18.959 | 22.058 |  |
| 4.009999999999616 | 18.969 | 22.071 |  |
| 4.004999999999617 | 18.979 | 22.085 |  |
| 3.999999999999617 | 18.989 | 22.098 |  |
| 3.994999999999617 | 18.999 | 22.111 |  |
| 3.989999999999617 | 19.009 | 22.125 |  |
| 3.984999999999617 | 19.019 | 22.138 |  |
| 3.979999999999618 | 19.029 | 22.151 |  |
| 3.974999999999618 | 19.039 | 22.165 |  |
| 3.969999999999618 | 19.048 | 22.178 |  |
| 3.964999999999618 | 19.058 | 22.191 |  |
| 3.959999999999618 | 19.068 | 22.205 |  |
| 3.954999999999618 | 19.078 | 22.218 |  |
| 3.949999999999618 | 19.088 | 22.231 |  |
| 3.944999999999618 | 19.098 | 22.245 |  |
| 3.939999999999618 | 19.108 | 22.258 |  |
| 3.934999999999619 | 19.118 | 22.271 |  |
| 3.929999999999619 | 19.128 | 22.284 |  |
| 3.924999999999619 | 19.138 | 22.298 |  |
| 3.919999999999619 | 19.148 | 22.311 |  |
| 3.914999999999619 | 19.158 | 22.324 |  |
| 3.909999999999619 | 19.168 | 22.338 |  |
| 3.904999999999619 | 19.177 | 22.351 |  |
| 3.899999999999619 | 19.187 | 22.364 |  |
| 3.894999999999619 | 19.197 | 22.377 |  |
| 3.889999999999619 | 19.207 | 22.391 |  |
| 3.88499999999962 | 19.217 | 22.404 |  |
| 3.87999999999962 | 19.227 | 22.417 |  |
| 3.87499999999962 | 19.237 | 22.431 |  |
| 3.86999999999962 | 19.246 | 22.444 |  |
| 3.86499999999962 | 19.256 | 22.457 |  |
| 3.85999999999962 | 19.266 | 22.47 |  |
| 3.85499999999962 | 19.276 | 22.484 |  |
| 3.84999999999962 | 19.286 | 22.497 |  |
| 3.84499999999962 | 19.296 | 22.51 |  |
| 3.839999999999621 | 19.305 | 22.523 |  |
| 3.834999999999621 | 19.315 | 22.537 |  |
| 3.829999999999621 | 19.325 | 22.55 |  |
| 3.824999999999621 | 19.335 | 22.563 |  |
| 3.819999999999621 | 19.345 | 22.576 |  |
| 3.814999999999621 | 19.354 | 22.59 |  |
| 3.809999999999621 | 19.364 | 22.603 |  |
| 3.804999999999621 | 19.374 | 22.616 |  |
| 3.799999999999621 | 19.384 | 22.629 |  |
| 3.794999999999621 | 19.393 | 22.642 |  |
| 3.789999999999622 | 19.403 | 22.656 |  |
| 3.784999999999622 | 19.413 | 22.669 |  |
| 3.779999999999622 | 19.422 | 22.682 |  |
| 3.774999999999622 | 19.432 | 22.695 |  |
| 3.769999999999622 | 19.442 | 22.709 |  |
| 3.764999999999622 | 19.452 | 22.722 |  |
| 3.759999999999622 | 19.461 | 22.735 |  |
| 3.754999999999622 | 19.471 | 22.748 |  |
| 3.749999999999622 | 19.481 | 22.761 |  |
| 3.744999999999623 | 19.49 | 22.775 |  |
| 3.739999999999623 | 19.5 | 22.788 |  |
| 3.734999999999623 | 19.51 | 22.801 |  |
| 3.729999999999623 | 19.519 | 22.814 |  |
| 3.724999999999623 | 19.529 | 22.827 |  |
| 3.719999999999623 | 19.539 | 22.841 |  |
| 3.714999999999623 | 19.548 | 22.854 |  |
| 3.709999999999623 | 19.558 | 22.867 |  |
| 3.704999999999623 | 19.568 | 22.88 |  |
| 3.699999999999623 | 19.577 | 22.893 |  |
| 3.694999999999624 | 19.587 | 22.907 |  |
| 3.689999999999624 | 19.596 | 22.92 |  |
| 3.684999999999624 | 19.606 | 22.933 |  |
| 3.679999999999624 | 19.616 | 22.946 |  |
| 3.674999999999624 | 19.625 | 22.959 |  |
| 3.669999999999624 | 19.635 | 22.972 |  |
| 3.664999999999624 | 19.644 | 22.986 |  |
| 3.659999999999624 | 19.654 | 22.999 |  |
| 3.654999999999624 | 19.663 | 23.012 |  |
| 3.649999999999625 | 19.673 | 23.025 |  |
| 3.644999999999625 | 19.683 | 23.038 |  |
| 3.639999999999625 | 19.692 | 23.051 |  |
| 3.634999999999625 | 19.702 | 23.064 |  |
| 3.629999999999625 | 19.711 | 23.078 |  |
| 3.624999999999625 | 19.721 | 23.091 |  |
| 3.619999999999625 | 19.73 | 23.104 |  |
| 3.614999999999625 | 19.74 | 23.117 |  |
| 3.609999999999625 | 19.749 | 23.13 |  |
| 3.604999999999626 | 19.759 | 23.143 |  |
| 3.599999999999626 | 19.768 | 23.156 |  |
| 3.594999999999626 | 19.778 | 23.17 |  |
| 3.589999999999626 | 19.787 | 23.183 |  |
| 3.584999999999626 | 19.797 | 23.196 |  |
| 3.579999999999626 | 19.806 | 23.209 |  |
| 3.574999999999626 | 19.816 | 23.222 |  |
| 3.569999999999626 | 19.825 | 23.235 |  |
| 3.564999999999626 | 19.834 | 23.248 |  |
| 3.559999999999627 | 19.844 | 23.262 |  |
| 3.554999999999627 | 19.853 | 23.275 |  |
| 3.549999999999627 | 19.863 | 23.288 |  |
| 3.544999999999627 | 19.872 | 23.301 |  |
| 3.539999999999627 | 19.882 | 23.314 |  |
| 3.534999999999627 | 19.891 | 23.327 |  |
| 3.529999999999627 | 19.9 | 23.34 |  |
| 3.524999999999627 | 19.91 | 23.353 |  |
| 3.519999999999627 | 19.919 | 23.366 |  |
| 3.514999999999628 | 19.929 | 23.379 |  |
| 3.509999999999628 | 19.938 | 23.393 |  |
| 3.504999999999628 | 19.947 | 23.406 |  |
| 3.499999999999628 | 19.957 | 23.419 |  |
| 3.494999999999628 | 19.966 | 23.432 |  |
| 3.489999999999628 | 19.975 | 23.445 |  |
| 3.484999999999628 | 19.985 | 23.458 |  |
| 3.479999999999628 | 19.994 | 23.471 |  |
| 3.474999999999628 | 20.003 | 23.484 |  |
| 3.469999999999628 | 20.013 | 23.497 |  |
| 3.464999999999629 | 20.022 | 23.51 |  |
| 3.459999999999629 | 20.031 | 23.523 |  |
| 3.454999999999629 | 20.041 | 23.537 |  |
| 3.449999999999629 | 20.05 | 23.55 |  |
| 3.444999999999629 | 20.059 | 23.563 |  |
| 3.439999999999629 | 20.068 | 23.576 |  |
| 3.434999999999629 | 20.078 | 23.589 |  |
| 3.429999999999629 | 20.087 | 23.602 |  |
| 3.424999999999629 | 20.096 | 23.615 |  |
| 3.41999999999963 | 20.105 | 23.628 |  |
| 3.41499999999963 | 20.115 | 23.641 |  |
| 3.40999999999963 | 20.124 | 23.654 |  |
| 3.40499999999963 | 20.133 | 23.667 |  |
| 3.39999999999963 | 20.142 | 23.68 |  |
| 3.39499999999963 | 20.152 | 23.693 |  |
| 3.38999999999963 | 20.161 | 23.706 |  |
| 3.38499999999963 | 20.17 | 23.72 |  |
| 3.37999999999963 | 20.179 | 23.733 |  |
| 3.37499999999963 | 20.188 | 23.746 |  |
| 3.369999999999631 | 20.198 | 23.759 |  |
| 3.364999999999631 | 20.207 | 23.772 |  |
| 3.359999999999631 | 20.216 | 23.785 |  |
| 3.354999999999631 | 20.225 | 23.798 |  |
| 3.349999999999631 | 20.234 | 23.811 |  |
| 3.344999999999631 | 20.243 | 23.824 |  |
| 3.339999999999631 | 20.253 | 23.837 |  |
| 3.334999999999631 | 20.262 | 23.85 |  |
| 3.329999999999631 | 20.271 | 23.863 |  |
| 3.324999999999632 | 20.28 | 23.876 |  |
| 3.319999999999632 | 20.289 | 23.889 |  |
| 3.314999999999632 | 20.298 | 23.902 |  |
| 3.309999999999632 | 20.307 | 23.915 |  |
| 3.304999999999632 | 20.316 | 23.928 |  |
| 3.299999999999632 | 20.325 | 23.941 |  |
| 3.294999999999632 | 20.334 | 23.954 |  |
| 3.289999999999632 | 20.344 | 23.967 |  |
| 3.284999999999632 | 20.353 | 23.98 |  |
| 3.279999999999633 | 20.362 | 23.993 |  |
| 3.274999999999633 | 20.371 | 24.006 |  |
| 3.269999999999633 | 20.38 | 24.019 |  |
| 3.264999999999633 | 20.389 | 24.032 |  |
| 3.259999999999633 | 20.398 | 24.045 |  |
| 3.254999999999633 | 20.407 | 24.059 |  |
| 3.249999999999633 | 20.416 | 24.072 |  |
| 3.244999999999633 | 20.425 | 24.085 |  |
| 3.239999999999633 | 20.434 | 24.098 |  |
| 3.234999999999633 | 20.443 | 24.111 |  |
| 3.229999999999634 | 20.452 | 24.124 |  |
| 3.224999999999634 | 20.461 | 24.137 |  |
| 3.219999999999634 | 20.47 | 24.15 |  |
| 3.214999999999634 | 20.479 | 24.163 |  |
| 3.209999999999634 | 20.488 | 24.176 |  |
| 3.204999999999634 | 20.497 | 24.189 |  |
| 3.199999999999634 | 20.506 | 24.202 |  |
| 3.194999999999634 | 20.515 | 24.215 |  |
| 3.189999999999634 | 20.524 | 24.228 |  |
| 3.184999999999635 | 20.532 | 24.241 |  |
| 3.179999999999635 | 20.541 | 24.254 |  |
| 3.174999999999635 | 20.55 | 24.267 |  |
| 3.169999999999635 | 20.559 | 24.28 |  |
| 3.164999999999635 | 20.568 | 24.293 |  |
| 3.159999999999635 | 20.577 | 24.306 |  |
| 3.154999999999635 | 20.586 | 24.319 |  |
| 3.149999999999635 | 20.595 | 24.332 |  |
| 3.144999999999635 | 20.604 | 24.345 |  |
| 3.139999999999636 | 20.613 | 24.358 |  |
| 3.134999999999636 | 20.621 | 24.371 |  |
| 3.129999999999636 | 20.63 | 24.384 |  |
| 3.124999999999636 | 20.639 | 24.397 |  |
| 3.119999999999636 | 20.648 | 24.41 |  |
| 3.114999999999636 | 20.657 | 24.423 |  |
| 3.109999999999636 | 20.666 | 24.436 |  |
| 3.104999999999636 | 20.674 | 24.449 |  |
| 3.099999999999636 | 20.683 | 24.462 |  |
| 3.094999999999636 | 20.692 | 24.475 |  |
| 3.089999999999637 | 20.701 | 24.488 |  |
| 3.084999999999637 | 20.71 | 24.501 |  |
| 3.079999999999637 | 20.718 | 24.514 |  |
| 3.074999999999637 | 20.727 | 24.527 |  |
| 3.069999999999637 | 20.736 | 24.54 |  |
| 3.064999999999637 | 20.745 | 24.553 |  |
| 3.059999999999637 | 20.753 | 24.566 |  |
| 3.054999999999637 | 20.762 | 24.579 |  |
| 3.049999999999637 | 20.771 | 24.592 |  |
| 3.044999999999638 | 20.78 | 24.605 |  |
| 3.039999999999638 | 20.788 | 24.618 |  |
| 3.034999999999638 | 20.797 | 24.631 |  |
| 3.029999999999638 | 20.806 | 24.644 |  |
| 3.024999999999638 | 20.814 | 24.657 |  |
| 3.019999999999638 | 20.823 | 24.67 |  |
| 3.014999999999638 | 20.832 | 24.683 |  |
| 3.009999999999638 | 20.84 | 24.696 |  |
| 3.004999999999638 | 20.849 | 24.709 |  |
| 2.999999999999638 | 20.858 | 24.722 |  |
| 2.994999999999639 | 20.866 | 24.735 |  |
| 2.989999999999639 | 20.875 | 24.748 |  |
| 2.984999999999639 | 20.884 | 24.761 |  |
| 2.979999999999639 | 20.892 | 24.774 |  |
| 2.974999999999639 | 20.901 | 24.787 |  |
| 2.969999999999639 | 20.91 | 24.8 |  |
| 2.964999999999639 | 20.918 | 24.812 |  |
| 2.959999999999639 | 20.927 | 24.825 |  |
| 2.954999999999639 | 20.935 | 24.838 |  |
| 2.94999999999964 | 20.944 | 24.851 |  |
| 2.94499999999964 | 20.953 | 24.864 |  |
| 2.93999999999964 | 20.961 | 24.877 |  |
| 2.93499999999964 | 20.97 | 24.89 |  |
| 2.92999999999964 | 20.978 | 24.903 |  |
| 2.92499999999964 | 20.987 | 24.916 |  |
| 2.91999999999964 | 20.995 | 24.929 |  |
| 2.91499999999964 | 21.004 | 24.942 |  |
| 2.90999999999964 | 21.013 | 24.955 |  |
| 2.904999999999641 | 21.021 | 24.968 |  |
| 2.899999999999641 | 21.03 | 24.981 |  |
| 2.894999999999641 | 21.038 | 24.994 |  |
| 2.889999999999641 | 21.047 | 25.007 |  |
| 2.884999999999641 | 21.055 | 25.02 |  |
| 2.879999999999641 | 21.064 | 25.033 |  |
| 2.874999999999641 | 21.072 | 25.046 |  |
| 2.869999999999641 | 21.081 | 25.059 |  |
| 2.864999999999641 | 21.089 | 25.072 |  |
| 2.859999999999641 | 21.097 | 25.085 |  |
| 2.854999999999642 | 21.106 | 25.098 |  |
| 2.849999999999642 | 21.114 | 25.111 |  |
| 2.844999999999642 | 21.123 | 25.124 |  |
| 2.839999999999642 | 21.131 | 25.137 |  |
| 2.834999999999642 | 21.14 | 25.15 |  |
| 2.829999999999642 | 21.148 | 25.163 |  |
| 2.824999999999642 | 21.156 | 25.176 |  |
| 2.819999999999642 | 21.165 | 25.189 |  |
| 2.814999999999642 | 21.173 | 25.202 |  |
| 2.809999999999643 | 21.182 | 25.215 |  |
| 2.804999999999643 | 21.19 | 25.228 |  |
| 2.799999999999643 | 21.198 | 25.241 |  |
| 2.794999999999643 | 21.207 | 25.255 |  |
| 2.789999999999643 | 21.215 | 25.268 |  |
| 2.784999999999643 | 21.223 | 25.281 |  |
| 2.779999999999643 | 21.232 | 25.294 |  |
| 2.774999999999643 | 21.24 | 25.307 |  |
| 2.769999999999643 | 21.248 | 25.32 |  |
| 2.764999999999643 | 21.257 | 25.333 |  |
| 2.759999999999644 | 21.265 | 25.346 |  |
| 2.754999999999644 | 21.273 | 25.359 |  |
| 2.749999999999644 | 21.282 | 25.372 |  |
| 2.744999999999644 | 21.29 | 25.385 |  |
| 2.739999999999644 | 21.298 | 25.398 |  |
| 2.734999999999644 | 21.307 | 25.411 |  |
| 2.729999999999644 | 21.315 | 25.424 |  |
| 2.724999999999644 | 21.323 | 25.437 |  |
| 2.719999999999644 | 21.331 | 25.45 |  |
| 2.714999999999645 | 21.34 | 25.463 |  |
| 2.709999999999645 | 21.348 | 25.476 |  |
| 2.704999999999645 | 21.356 | 25.489 |  |
| 2.699999999999645 | 21.364 | 25.502 |  |
| 2.694999999999645 | 21.372 | 25.515 |  |
| 2.689999999999645 | 21.381 | 25.528 |  |
| 2.684999999999645 | 21.389 | 25.541 |  |
| 2.679999999999645 | 21.397 | 25.554 |  |
| 2.674999999999645 | 21.405 | 25.567 |  |
| 2.669999999999645 | 21.413 | 25.58 |  |
| 2.664999999999646 | 21.422 | 25.593 |  |
| 2.659999999999646 | 21.43 | 25.607 |  |
| 2.654999999999646 | 21.438 | 25.62 |  |
| 2.649999999999646 | 21.446 | 25.633 |  |
| 2.644999999999646 | 21.454 | 25.646 |  |
| 2.639999999999646 | 21.462 | 25.659 |  |
| 2.634999999999646 | 21.47 | 25.672 |  |
| 2.629999999999646 | 21.478 | 25.685 |  |
| 2.624999999999646 | 21.487 | 25.698 |  |
| 2.619999999999647 | 21.495 | 25.711 |  |
| 2.614999999999647 | 21.503 | 25.724 |  |
| 2.609999999999647 | 21.511 | 25.737 |  |
| 2.604999999999647 | 21.519 | 25.75 |  |
| 2.599999999999647 | 21.527 | 25.764 |  |
| 2.594999999999647 | 21.535 | 25.777 |  |
| 2.589999999999647 | 21.543 | 25.79 |  |
| 2.584999999999647 | 21.551 | 25.803 |  |
| 2.579999999999647 | 21.559 | 25.816 |  |
| 2.574999999999648 | 21.567 | 25.829 |  |
| 2.569999999999648 | 21.575 | 25.842 |  |
| 2.564999999999648 | 21.583 | 25.855 |  |
| 2.559999999999648 | 21.591 | 25.868 |  |
| 2.554999999999648 | 21.599 | 25.882 |  |
| 2.549999999999648 | 21.607 | 25.895 |  |
| 2.544999999999648 | 21.615 | 25.908 |  |
| 2.539999999999648 | 21.623 | 25.921 |  |
| 2.534999999999648 | 21.631 | 25.934 |  |
| 2.529999999999649 | 21.639 | 25.947 |  |
| 2.524999999999649 | 21.647 | 25.96 |  |
| 2.519999999999649 | 21.655 | 25.974 |  |
| 2.514999999999649 | 21.663 | 25.987 |  |
| 2.509999999999649 | 21.671 | 26 |  |
| 2.504999999999649 | 21.679 | 26.013 |  |
| 2.499999999999649 | 21.687 | 26.026 |  |
| 2.494999999999649 | 21.695 | 26.039 |  |
| 2.489999999999649 | 21.702 | 26.053 |  |
| 2.484999999999649 | 21.71 | 26.066 |  |
| 2.47999999999965 | 21.718 | 26.079 |  |
| 2.47499999999965 | 21.726 | 26.092 |  |
| 2.46999999999965 | 21.734 | 26.105 |  |
| 2.46499999999965 | 21.742 | 26.119 |  |
| 2.45999999999965 | 21.75 | 26.132 |  |
| 2.45499999999965 | 21.758 | 26.145 |  |
| 2.44999999999965 | 21.765 | 26.158 |  |
| 2.44499999999965 | 21.773 | 26.172 |  |
| 2.43999999999965 | 21.781 | 26.185 |  |
| 2.434999999999651 | 21.789 | 26.198 |  |
| 2.429999999999651 | 21.797 | 26.211 |  |
| 2.424999999999651 | 21.804 | 26.224 |  |
| 2.419999999999651 | 21.812 | 26.238 |  |
| 2.414999999999651 | 21.82 | 26.251 |  |
| 2.409999999999651 | 21.828 | 26.264 |  |
| 2.404999999999651 | 21.835 | 26.278 |  |
| 2.399999999999651 | 21.843 | 26.291 |  |
| 2.394999999999651 | 21.851 | 26.304 |  |
| 2.389999999999651 | 21.859 | 26.317 |  |
| 2.384999999999652 | 21.866 | 26.331 |  |
| 2.379999999999652 | 21.874 | 26.344 |  |
| 2.374999999999652 | 21.882 | 26.357 |  |
| 2.369999999999652 | 21.89 | 26.371 |  |
| 2.364999999999652 | 21.897 | 26.384 |  |
| 2.359999999999652 | 21.905 | 26.397 |  |
| 2.354999999999652 | 21.913 | 26.411 |  |
| 2.349999999999652 | 21.92 | 26.424 |  |
| 2.344999999999652 | 21.928 | 26.437 |  |
| 2.339999999999653 | 21.936 | 26.451 |  |
| 2.334999999999653 | 21.943 | 26.464 |  |
| 2.329999999999653 | 21.951 | 26.477 |  |
| 2.324999999999653 | 21.958 | 26.491 |  |
| 2.319999999999653 | 21.966 | 26.504 |  |
| 2.314999999999653 | 21.974 | 26.517 |  |
| 2.309999999999653 | 21.981 | 26.531 |  |
| 2.304999999999653 | 21.989 | 26.544 |  |
| 2.299999999999653 | 21.996 | 26.558 |  |
| 2.294999999999654 | 22.004 | 26.571 |  |
| 2.289999999999654 | 22.012 | 26.585 |  |
| 2.284999999999654 | 22.019 | 26.598 |  |
| 2.279999999999654 | 22.027 | 26.611 |  |
| 2.274999999999654 | 22.034 | 26.625 |  |
| 2.269999999999654 | 22.042 | 26.638 |  |
| 2.264999999999654 | 22.049 | 26.652 |  |
| 2.259999999999654 | 22.057 | 26.665 |  |
| 2.254999999999654 | 22.064 | 26.679 |  |
| 2.249999999999654 | 22.072 | 26.692 |  |
| 2.244999999999655 | 22.079 | 26.706 |  |
| 2.239999999999655 | 22.087 | 26.719 |  |
| 2.234999999999655 | 22.094 | 26.733 |  |
| 2.229999999999655 | 22.102 | 26.746 |  |
| 2.224999999999655 | 22.109 | 26.76 |  |
| 2.219999999999655 | 22.117 | 26.773 |  |
| 2.214999999999655 | 22.124 | 26.787 |  |
| 2.209999999999655 | 22.132 | 26.801 |  |
| 2.204999999999655 | 22.139 | 26.814 |  |
| 2.199999999999656 | 22.146 | 26.828 |  |
| 2.194999999999656 | 22.154 | 26.841 |  |
| 2.189999999999656 | 22.161 | 26.855 |  |
| 2.184999999999656 | 22.169 | 26.869 |  |
| 2.179999999999656 | 22.176 | 26.882 |  |
| 2.174999999999656 | 22.183 | 26.896 |  |
| 2.169999999999656 | 22.191 | 26.909 |  |
| 2.164999999999656 | 22.198 | 26.923 |  |
| 2.159999999999656 | 22.206 | 26.937 |  |
| 2.154999999999657 | 22.213 | 26.951 |  |
| 2.149999999999657 | 22.22 | 26.964 |  |
| 2.144999999999657 | 22.228 | 26.978 |  |
| 2.139999999999657 | 22.235 | 26.992 |  |
| 2.134999999999657 | 22.242 | 27.005 |  |
| 2.129999999999657 | 22.249 | 27.019 |  |
| 2.124999999999657 | 22.257 | 27.033 |  |
| 2.119999999999657 | 22.264 | 27.047 |  |
| 2.114999999999657 | 22.271 | 27.06 |  |
| 2.109999999999657 | 22.279 | 27.074 |  |
| 2.104999999999658 | 22.286 | 27.088 |  |
| 2.099999999999658 | 22.293 | 27.102 |  |
| 2.094999999999658 | 22.3 | 27.116 |  |
| 2.089999999999658 | 22.308 | 27.13 |  |
| 2.084999999999658 | 22.315 | 27.143 |  |
| 2.079999999999658 | 22.322 | 27.157 |  |
| 2.074999999999658 | 22.329 | 27.171 |  |
| 2.069999999999658 | 22.336 | 27.185 |  |
| 2.064999999999658 | 22.344 | 27.199 |  |
| 2.059999999999659 | 22.351 | 27.213 |  |
| 2.054999999999659 | 22.358 | 27.227 |  |
| 2.049999999999659 | 22.365 | 27.241 |  |
| 2.044999999999659 | 22.372 | 27.255 |  |
| 2.039999999999659 | 22.379 | 27.269 |  |
| 2.034999999999659 | 22.387 | 27.283 |  |
| 2.029999999999659 | 22.394 | 27.297 |  |
| 2.024999999999659 | 22.401 | 27.311 |  |
| 2.019999999999659 | 22.408 | 27.325 |  |
| 2.01499999999966 | 22.415 | 27.339 |  |
| 2.00999999999966 | 22.422 | 27.353 |  |
| 2.00499999999966 | 22.429 | 27.367 |  |
| 1.99999999999966 | 22.436 | 27.382 |  |
| 1.99499999999966 | 22.443 | 27.396 |  |
| 1.98999999999966 | 22.45 | 27.41 |  |
| 1.98499999999966 | 22.457 | 27.424 |  |
| 1.97999999999966 | 22.465 | 27.438 |  |
| 1.97499999999966 | 22.472 | 27.452 |  |
| 1.96999999999966 | 22.479 | 27.467 |  |
| 1.964999999999661 | 22.486 | 27.481 |  |
| 1.959999999999661 | 22.493 | 27.495 |  |
| 1.954999999999661 | 22.5 | 27.51 |  |
| 1.949999999999661 | 22.507 | 27.524 |  |
| 1.944999999999661 | 22.514 | 27.538 |  |
| 1.939999999999661 | 22.521 | 27.553 |  |
| 1.934999999999661 | 22.527 | 27.567 |  |
| 1.929999999999661 | 22.534 | 27.581 |  |
| 1.924999999999661 | 22.541 | 27.596 |  |
| 1.919999999999662 | 22.548 | 27.61 |  |
| 1.914999999999662 | 22.555 | 27.625 |  |
| 1.909999999999662 | 22.562 | 27.639 |  |
| 1.904999999999662 | 22.569 | 27.654 |  |
| 1.899999999999662 | 22.576 | 27.668 |  |
| 1.894999999999662 | 22.583 | 27.683 |  |
| 1.889999999999662 | 22.59 | 27.697 |  |
| 1.884999999999662 | 22.597 | 27.712 |  |
| 1.879999999999662 | 22.603 | 27.727 |  |
| 1.874999999999662 | 22.61 | 27.741 |  |
| 1.869999999999663 | 22.617 | 27.756 |  |
| 1.864999999999663 | 22.624 | 27.771 |  |
| 1.859999999999663 | 22.631 | 27.785 |  |
| 1.854999999999663 | 22.638 | 27.8 |  |
| 1.849999999999663 | 22.644 | 27.815 |  |
| 1.844999999999663 | 22.651 | 27.83 |  |
| 1.839999999999663 | 22.658 | 27.845 |  |
| 1.834999999999663 | 22.665 | 27.859 |  |
| 1.829999999999663 | 22.672 | 27.874 |  |
| 1.824999999999664 | 22.678 | 27.889 |  |
| 1.819999999999664 | 22.685 | 27.904 |  |
| 1.814999999999664 | 22.692 | 27.919 |  |
| 1.809999999999664 | 22.699 | 27.934 |  |
| 1.804999999999664 | 22.705 | 27.949 |  |
| 1.799999999999664 | 22.712 | 27.964 |  |
| 1.794999999999664 | 22.719 | 27.98 |  |
| 1.789999999999664 | 22.725 | 27.995 |  |
| 1.784999999999664 | 22.732 | 28.01 |  |
| 1.779999999999664 | 22.739 | 28.025 |  |
| 1.774999999999665 | 22.745 | 28.04 |  |
| 1.769999999999665 | 22.752 | 28.056 |  |
| 1.764999999999665 | 22.759 | 28.071 |  |
| 1.759999999999665 | 22.765 | 28.086 |  |
| 1.754999999999665 | 22.772 | 28.102 |  |
| 1.749999999999665 | 22.779 | 28.117 |  |
| 1.744999999999665 | 22.785 | 28.132 |  |
| 1.739999999999665 | 22.792 | 28.148 |  |
| 1.734999999999665 | 22.798 | 28.163 |  |
| 1.729999999999666 | 22.805 | 28.179 |  |
| 1.724999999999666 | 22.812 | 28.195 |  |
| 1.719999999999666 | 22.818 | 28.21 |  |
| 1.714999999999666 | 22.825 | 28.226 |  |
| 1.709999999999666 | 22.831 | 28.242 |  |
| 1.704999999999666 | 22.838 | 28.257 |  |
| 1.699999999999666 | 22.844 | 28.273 |  |
| 1.694999999999666 | 22.851 | 28.289 |  |
| 1.689999999999666 | 22.857 | 28.305 |  |
| 1.684999999999666 | 22.864 | 28.321 |  |
| 1.679999999999667 | 22.87 | 28.337 |  |
| 1.674999999999667 | 22.877 | 28.353 |  |
| 1.669999999999667 | 22.883 | 28.369 |  |
| 1.664999999999667 | 22.89 | 28.385 |  |
| 1.659999999999667 | 22.896 | 28.401 |  |
| 1.654999999999667 | 22.903 | 28.418 |  |
| 1.649999999999667 | 22.909 | 28.434 |  |
| 1.644999999999667 | 22.915 | 28.45 |  |
| 1.639999999999667 | 22.922 | 28.467 |  |
| 1.634999999999668 | 22.928 | 28.483 |  |
| 1.629999999999668 | 22.935 | 28.5 |  |
| 1.624999999999668 | 22.941 | 28.516 |  |
| 1.619999999999668 | 22.947 | 28.533 |  |
| 1.614999999999668 | 22.954 | 28.549 |  |
| 1.609999999999668 | 22.96 | 28.566 |  |
| 1.604999999999668 | 22.966 | 28.583 |  |
| 1.599999999999668 | 22.973 | 28.6 |  |
| 1.594999999999668 | 22.979 | 28.617 |  |
| 1.589999999999669 | 22.985 | 28.633 |  |
| 1.584999999999669 | 22.992 | 28.651 |  |
| 1.579999999999669 | 22.998 | 28.668 |  |
| 1.574999999999669 | 23.004 | 28.685 |  |
| 1.569999999999669 | 23.01 | 28.702 |  |
| 1.564999999999669 | 23.017 | 28.719 |  |
| 1.559999999999669 | 23.023 | 28.737 |  |
| 1.554999999999669 | 23.029 | 28.754 |  |
| 1.549999999999669 | 23.035 | 28.772 |  |
| 1.54499999999967 | 23.042 | 28.789 |  |
| 1.53999999999967 | 23.048 | 28.807 |  |
| 1.53499999999967 | 23.054 | 28.825 |  |
| 1.52999999999967 | 23.06 | 28.842 |  |
| 1.52499999999967 | 23.066 | 28.86 |  |
| 1.51999999999967 | 23.073 | 28.878 |  |
| 1.51499999999967 | 23.079 | 28.896 |  |
| 1.50999999999967 | 23.085 | 28.914 |  |
| 1.50499999999967 | 23.091 | 28.933 |  |
| 1.49999999999967 | 23.097 | 28.951 |  |
| 1.494999999999671 | 23.103 | 28.969 |  |
| 1.489999999999671 | 23.109 | 28.988 |  |
| 1.484999999999671 | 23.115 | 29.007 |  |
| 1.479999999999671 | 23.122 | 29.025 |  |
| 1.474999999999671 | 23.128 | 29.044 |  |
| 1.469999999999671 | 23.134 | 29.063 |  |
| 1.464999999999671 | 23.14 | 29.082 |  |
| 1.459999999999671 | 23.146 | 29.101 |  |
| 1.454999999999671 | 23.152 | 29.12 |  |
| 1.449999999999672 | 23.158 | 29.14 |  |
| 1.444999999999672 | 23.164 | 29.159 |  |
| 1.439999999999672 | 23.17 | 29.179 |  |
| 1.434999999999672 | 23.176 | 29.198 |  |
| 1.429999999999672 | 23.182 | 29.218 |  |
| 1.424999999999672 | 23.188 | 29.238 |  |
| 1.419999999999672 | 23.194 | 29.258 |  |
| 1.414999999999672 | 23.2 | 29.278 |  |
| 1.409999999999672 | 23.206 | 29.299 |  |
| 1.404999999999672 | 23.212 | 29.319 |  |
| 1.399999999999673 | 23.218 | 29.34 |  |
| 1.394999999999673 | 23.223 | 29.361 |  |
| 1.389999999999673 | 23.229 | 29.382 |  |
| 1.384999999999673 | 23.235 | 29.403 |  |
| 1.379999999999673 | 23.241 | 29.424 |  |
| 1.374999999999673 | 23.247 | 29.445 |  |
| 1.369999999999673 | 23.253 | 29.467 |  |
| 1.364999999999673 | 23.259 | 29.489 |  |
| 1.359999999999673 | 23.265 | 29.511 |  |
| 1.354999999999674 | 23.27 | 29.533 |  |
| 1.349999999999674 | 23.276 | 29.555 |  |
| 1.344999999999674 | 23.282 | 29.578 |  |
| 1.339999999999674 | 23.288 | 29.6 |  |
| 1.334999999999674 | 23.294 | 29.623 |  |
| 1.329999999999674 | 23.299 | 29.646 |  |
| 1.324999999999674 | 23.305 | 29.67 |  |
| 1.319999999999674 | 23.311 | 29.693 |  |
| 1.314999999999674 | 23.317 | 29.717 |  |
| 1.309999999999674 | 23.322 | 29.741 |  |
| 1.304999999999675 | 23.328 | 29.765 |  |
| 1.299999999999675 | 23.334 | 29.79 |  |
| 1.294999999999675 | 23.339 | 29.815 |  |
| 1.289999999999675 | 23.345 | 29.84 |  |
| 1.284999999999675 | 23.351 | 29.865 |  |
| 1.279999999999675 | 23.356 | 29.891 |  |
| 1.274999999999675 | 23.362 | 29.917 |  |
| 1.269999999999675 | 23.368 | 29.943 |  |
| 1.264999999999675 | 23.373 | 29.97 |  |
| 1.259999999999676 | 23.379 | 29.997 |  |
| 1.254999999999676 | 23.385 | 30.025 |  |
| 1.249999999999676 | 23.39 | 30.052 |  |
| 1.244999999999676 | 23.396 | 30.08 |  |
| 1.239999999999676 | 23.401 | 30.109 |  |
| 1.234999999999676 | 23.407 | 30.138 |  |
| 1.229999999999676 | 23.412 | 30.167 |  |
| 1.224999999999676 | 23.418 | 30.197 |  |
| 1.219999999999676 | 23.424 | 30.228 |  |
| 1.214999999999677 | 23.429 | 30.259 |  |
| 1.209999999999677 | 23.435 | 30.29 |  |
| 1.204999999999677 | 23.44 | 30.322 |  |
| 1.199999999999677 | 23.446 | 30.355 |  |
| 1.194999999999677 | 23.451 | 30.388 |  |
| 1.189999999999677 | 23.456 | 30.422 |  |
| 1.184999999999677 | 23.462 | 30.456 |  |
| 1.179999999999677 | 23.467 | 30.491 |  |
| 1.174999999999677 | 23.473 | 30.527 |  |
| 1.169999999999677 | 23.478 | 30.564 |  |
| 1.164999999999678 | 23.484 | 30.602 |  |
| 1.159999999999678 | 23.489 | 30.64 |  |
| 1.154999999999678 | 23.494 | 30.68 |  |
| 1.149999999999678 | 23.5 | 30.72 |  |
| 1.144999999999678 | 23.505 | 30.762 |  |
| 1.139999999999678 | 23.51 | 30.805 |  |
| 1.134999999999678 | 23.516 | 30.849 |  |
| 1.129999999999678 | 23.521 | 30.895 |  |
| 1.124999999999678 | 23.526 | 30.941 |  |
| 1.119999999999679 | 23.532 | 30.99 |  |
| 1.114999999999679 | 23.537 | 31.04 |  |
| 1.109999999999679 | 23.542 | 31.092 |  |
| 1.104999999999679 | 23.548 | 31.147 |  |
| 1.099999999999679 | 23.553 | 31.203 |  |
| 1.094999999999679 | 23.558 | 31.262 |  |
| 1.089999999999679 | 23.563 | 31.324 |  |
| 1.084999999999679 | 23.568 | 31.389 |  |
| 1.079999999999679 | 23.574 | 31.457 |  |
| 1.07499999999968 | 23.579 | 31.529 |  |
| 1.06999999999968 | 23.584 | 31.606 |  |
| 1.06499999999968 | 23.589 | 31.688 |  |
| 1.05999999999968 | 23.594 | 31.775 |  |
| 1.05499999999968 | 23.599 | 31.87 |  |
| 1.04999999999968 | 23.605 | 31.973 |  |
| 1.04499999999968 | 23.61 | 32.086 |  |
| 1.03999999999968 | 23.615 | 32.211 |  |
| 1.03499999999968 | 23.62 | 32.352 |  |
| 1.02999999999968 | 23.625 | 32.514 |  |
| 1.024999999999681 | 23.63 | 32.704 |  |
| 1.019999999999681 | 23.635 | 32.934 |  |
| 1.014999999999681 | 23.64 | 33.23 |  |
| 1.009999999999681 | 23.645 | 33.643 |  |
| 1.004999999999681 | 23.65 | 34.343 |  |
| 0.999999999999681 | 23.655 | 57.826 |  |